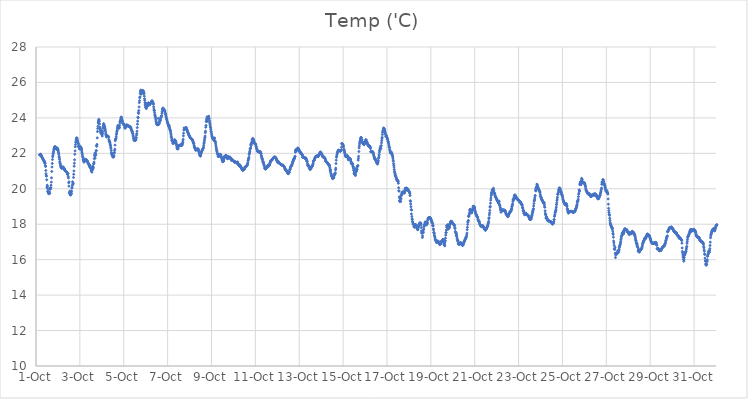
| Category | Temp ('C) |
|---|---|
| 44470.166666666664 | 21.901 |
| 44470.177083333336 | 21.917 |
| 44470.1875 | 21.921 |
| 44470.197916666664 | 21.93 |
| 44470.208333333336 | 21.951 |
| 44470.21875 | 21.933 |
| 44470.229166666664 | 21.903 |
| 44470.239583333336 | 21.851 |
| 44470.25 | 21.844 |
| 44470.260416666664 | 21.839 |
| 44470.270833333336 | 21.772 |
| 44470.28125 | 21.766 |
| 44470.291666666664 | 21.74 |
| 44470.302083333336 | 21.712 |
| 44470.3125 | 21.687 |
| 44470.322916666664 | 21.665 |
| 44470.333333333336 | 21.637 |
| 44470.34375 | 21.621 |
| 44470.354166666664 | 21.582 |
| 44470.364583333336 | 21.575 |
| 44470.375 | 21.547 |
| 44470.385416666664 | 21.524 |
| 44470.395833333336 | 21.463 |
| 44470.40625 | 21.459 |
| 44470.416666666664 | 21.432 |
| 44470.427083333336 | 21.306 |
| 44470.4375 | 21.258 |
| 44470.447916666664 | 21.032 |
| 44470.458333333336 | 20.848 |
| 44470.46875 | 20.729 |
| 44470.479166666664 | 20.719 |
| 44470.489583333336 | 20.507 |
| 44470.5 | 20.078 |
| 44470.510416666664 | 20.201 |
| 44470.520833333336 | 20.128 |
| 44470.53125 | 19.854 |
| 44470.541666666664 | 19.99 |
| 44470.552083333336 | 19.847 |
| 44470.5625 | 19.796 |
| 44470.572916666664 | 19.723 |
| 44470.583333333336 | 19.796 |
| 44470.59375 | 19.752 |
| 44470.604166666664 | 19.732 |
| 44470.614583333336 | 19.823 |
| 44470.625 | 19.741 |
| 44470.635416666664 | 20.01 |
| 44470.645833333336 | 19.971 |
| 44470.65625 | 20.056 |
| 44470.666666666664 | 20.004 |
| 44470.677083333336 | 20.052 |
| 44470.6875 | 20.198 |
| 44470.697916666664 | 20.375 |
| 44470.708333333336 | 20.617 |
| 44470.71875 | 20.979 |
| 44470.729166666664 | 21.23 |
| 44470.739583333336 | 21.43 |
| 44470.75 | 21.65 |
| 44470.760416666664 | 21.806 |
| 44470.770833333336 | 21.893 |
| 44470.78125 | 21.972 |
| 44470.791666666664 | 22.046 |
| 44470.802083333336 | 22.118 |
| 44470.8125 | 22.213 |
| 44470.822916666664 | 22.27 |
| 44470.833333333336 | 22.299 |
| 44470.84375 | 22.361 |
| 44470.854166666664 | 22.358 |
| 44470.864583333336 | 22.369 |
| 44470.875 | 22.365 |
| 44470.885416666664 | 22.349 |
| 44470.895833333336 | 22.336 |
| 44470.90625 | 22.324 |
| 44470.916666666664 | 22.285 |
| 44470.927083333336 | 22.234 |
| 44470.9375 | 22.228 |
| 44470.947916666664 | 22.246 |
| 44470.958333333336 | 22.294 |
| 44470.96875 | 22.253 |
| 44470.979166666664 | 22.286 |
| 44470.989583333336 | 22.243 |
| 44471.0 | 22.217 |
| 44471.010416666664 | 22.149 |
| 44471.020833333336 | 22.077 |
| 44471.03125 | 22.027 |
| 44471.041666666664 | 21.939 |
| 44471.052083333336 | 21.826 |
| 44471.0625 | 21.758 |
| 44471.072916666664 | 21.666 |
| 44471.083333333336 | 21.54 |
| 44471.09375 | 21.46 |
| 44471.104166666664 | 21.415 |
| 44471.114583333336 | 21.343 |
| 44471.125 | 21.276 |
| 44471.135416666664 | 21.243 |
| 44471.145833333336 | 21.2 |
| 44471.15625 | 21.172 |
| 44471.166666666664 | 21.156 |
| 44471.177083333336 | 21.251 |
| 44471.1875 | 21.169 |
| 44471.197916666664 | 21.225 |
| 44471.208333333336 | 21.168 |
| 44471.21875 | 21.193 |
| 44471.229166666664 | 21.202 |
| 44471.239583333336 | 21.214 |
| 44471.25 | 21.211 |
| 44471.260416666664 | 21.179 |
| 44471.270833333336 | 21.159 |
| 44471.28125 | 21.152 |
| 44471.291666666664 | 21.126 |
| 44471.302083333336 | 21.075 |
| 44471.3125 | 21.047 |
| 44471.322916666664 | 21.03 |
| 44471.333333333336 | 21.018 |
| 44471.34375 | 21.004 |
| 44471.354166666664 | 21.003 |
| 44471.364583333336 | 20.98 |
| 44471.375 | 20.969 |
| 44471.385416666664 | 20.954 |
| 44471.395833333336 | 20.945 |
| 44471.40625 | 20.946 |
| 44471.416666666664 | 20.909 |
| 44471.427083333336 | 20.82 |
| 44471.4375 | 20.84 |
| 44471.447916666664 | 20.859 |
| 44471.458333333336 | 20.855 |
| 44471.46875 | 20.705 |
| 44471.479166666664 | 20.613 |
| 44471.489583333336 | 20.338 |
| 44471.5 | 20.15 |
| 44471.510416666664 | 20.392 |
| 44471.520833333336 | 19.788 |
| 44471.53125 | 19.754 |
| 44471.541666666664 | 19.869 |
| 44471.552083333336 | 19.675 |
| 44471.5625 | 19.66 |
| 44471.572916666664 | 19.834 |
| 44471.583333333336 | 19.649 |
| 44471.59375 | 19.779 |
| 44471.604166666664 | 19.734 |
| 44471.614583333336 | 19.716 |
| 44471.625 | 19.86 |
| 44471.635416666664 | 20.031 |
| 44471.645833333336 | 20.079 |
| 44471.65625 | 20.194 |
| 44471.666666666664 | 20.394 |
| 44471.677083333336 | 20.261 |
| 44471.6875 | 20.275 |
| 44471.697916666664 | 20.314 |
| 44471.708333333336 | 20.639 |
| 44471.71875 | 20.817 |
| 44471.729166666664 | 21.006 |
| 44471.739583333336 | 21.274 |
| 44471.75 | 21.44 |
| 44471.760416666664 | 21.637 |
| 44471.770833333336 | 21.947 |
| 44471.78125 | 22.136 |
| 44471.791666666664 | 22.369 |
| 44471.802083333336 | 22.492 |
| 44471.8125 | 22.621 |
| 44471.822916666664 | 22.704 |
| 44471.833333333336 | 22.804 |
| 44471.84375 | 22.831 |
| 44471.854166666664 | 22.872 |
| 44471.864583333336 | 22.863 |
| 44471.875 | 22.849 |
| 44471.885416666664 | 22.746 |
| 44471.895833333336 | 22.707 |
| 44471.90625 | 22.627 |
| 44471.916666666664 | 22.578 |
| 44471.927083333336 | 22.549 |
| 44471.9375 | 22.384 |
| 44471.947916666664 | 22.427 |
| 44471.958333333336 | 22.362 |
| 44471.96875 | 22.34 |
| 44471.979166666664 | 22.243 |
| 44471.989583333336 | 22.429 |
| 44472.0 | 22.324 |
| 44472.010416666664 | 22.347 |
| 44472.020833333336 | 22.372 |
| 44472.03125 | 22.335 |
| 44472.041666666664 | 22.337 |
| 44472.052083333336 | 22.325 |
| 44472.0625 | 22.26 |
| 44472.072916666664 | 22.236 |
| 44472.083333333336 | 22.151 |
| 44472.09375 | 22.063 |
| 44472.104166666664 | 21.989 |
| 44472.114583333336 | 21.911 |
| 44472.125 | 21.822 |
| 44472.135416666664 | 21.782 |
| 44472.145833333336 | 21.672 |
| 44472.15625 | 21.618 |
| 44472.166666666664 | 21.591 |
| 44472.177083333336 | 21.562 |
| 44472.1875 | 21.501 |
| 44472.197916666664 | 21.529 |
| 44472.208333333336 | 21.625 |
| 44472.21875 | 21.68 |
| 44472.229166666664 | 21.627 |
| 44472.239583333336 | 21.618 |
| 44472.25 | 21.634 |
| 44472.260416666664 | 21.614 |
| 44472.270833333336 | 21.624 |
| 44472.28125 | 21.654 |
| 44472.291666666664 | 21.637 |
| 44472.302083333336 | 21.608 |
| 44472.3125 | 21.599 |
| 44472.322916666664 | 21.587 |
| 44472.333333333336 | 21.572 |
| 44472.34375 | 21.544 |
| 44472.354166666664 | 21.513 |
| 44472.364583333336 | 21.478 |
| 44472.375 | 21.447 |
| 44472.385416666664 | 21.429 |
| 44472.395833333336 | 21.402 |
| 44472.40625 | 21.379 |
| 44472.416666666664 | 21.352 |
| 44472.427083333336 | 21.329 |
| 44472.4375 | 21.278 |
| 44472.447916666664 | 21.251 |
| 44472.458333333336 | 21.331 |
| 44472.46875 | 21.201 |
| 44472.479166666664 | 21.211 |
| 44472.489583333336 | 21.215 |
| 44472.5 | 21.17 |
| 44472.510416666664 | 21.065 |
| 44472.520833333336 | 20.999 |
| 44472.53125 | 21.019 |
| 44472.541666666664 | 21.058 |
| 44472.552083333336 | 20.94 |
| 44472.5625 | 21.066 |
| 44472.572916666664 | 21.188 |
| 44472.583333333336 | 21.09 |
| 44472.59375 | 21.275 |
| 44472.604166666664 | 21.155 |
| 44472.614583333336 | 21.213 |
| 44472.625 | 21.409 |
| 44472.635416666664 | 21.422 |
| 44472.645833333336 | 21.508 |
| 44472.65625 | 21.701 |
| 44472.666666666664 | 21.896 |
| 44472.677083333336 | 21.854 |
| 44472.6875 | 22.013 |
| 44472.697916666664 | 21.731 |
| 44472.708333333336 | 21.928 |
| 44472.71875 | 22.006 |
| 44472.729166666664 | 21.898 |
| 44472.739583333336 | 22.145 |
| 44472.75 | 22.152 |
| 44472.760416666664 | 22.43 |
| 44472.770833333336 | 22.398 |
| 44472.78125 | 22.503 |
| 44472.791666666664 | 22.873 |
| 44472.802083333336 | 23.231 |
| 44472.8125 | 23.405 |
| 44472.822916666664 | 23.527 |
| 44472.833333333336 | 23.708 |
| 44472.84375 | 23.789 |
| 44472.854166666664 | 23.86 |
| 44472.864583333336 | 23.915 |
| 44472.875 | 23.87 |
| 44472.885416666664 | 23.791 |
| 44472.895833333336 | 23.653 |
| 44472.90625 | 23.394 |
| 44472.916666666664 | 23.468 |
| 44472.927083333336 | 23.371 |
| 44472.9375 | 23.272 |
| 44472.947916666664 | 23.195 |
| 44472.958333333336 | 23.206 |
| 44472.96875 | 23.118 |
| 44472.979166666664 | 23.106 |
| 44472.989583333336 | 23.089 |
| 44473.0 | 23.285 |
| 44473.010416666664 | 23.064 |
| 44473.020833333336 | 22.98 |
| 44473.03125 | 23.128 |
| 44473.041666666664 | 23.229 |
| 44473.052083333336 | 23.49 |
| 44473.0625 | 23.411 |
| 44473.072916666664 | 23.599 |
| 44473.083333333336 | 23.681 |
| 44473.09375 | 23.63 |
| 44473.104166666664 | 23.55 |
| 44473.114583333336 | 23.565 |
| 44473.125 | 23.492 |
| 44473.135416666664 | 23.474 |
| 44473.145833333336 | 23.388 |
| 44473.15625 | 23.323 |
| 44473.166666666664 | 23.243 |
| 44473.177083333336 | 23.136 |
| 44473.1875 | 23.061 |
| 44473.197916666664 | 23.01 |
| 44473.208333333336 | 22.969 |
| 44473.21875 | 22.926 |
| 44473.229166666664 | 22.925 |
| 44473.239583333336 | 22.976 |
| 44473.25 | 23 |
| 44473.260416666664 | 22.952 |
| 44473.270833333336 | 22.971 |
| 44473.28125 | 22.968 |
| 44473.291666666664 | 22.938 |
| 44473.302083333336 | 22.948 |
| 44473.3125 | 22.906 |
| 44473.322916666664 | 22.778 |
| 44473.333333333336 | 22.697 |
| 44473.34375 | 22.68 |
| 44473.354166666664 | 22.666 |
| 44473.364583333336 | 22.626 |
| 44473.375 | 22.575 |
| 44473.385416666664 | 22.492 |
| 44473.395833333336 | 22.437 |
| 44473.40625 | 22.349 |
| 44473.416666666664 | 22.285 |
| 44473.427083333336 | 22.172 |
| 44473.4375 | 22.052 |
| 44473.447916666664 | 21.987 |
| 44473.458333333336 | 21.931 |
| 44473.46875 | 21.918 |
| 44473.479166666664 | 21.869 |
| 44473.489583333336 | 21.871 |
| 44473.5 | 21.796 |
| 44473.510416666664 | 21.81 |
| 44473.520833333336 | 21.792 |
| 44473.53125 | 21.798 |
| 44473.541666666664 | 21.817 |
| 44473.552083333336 | 21.866 |
| 44473.5625 | 22.011 |
| 44473.572916666664 | 22.035 |
| 44473.583333333336 | 22.153 |
| 44473.59375 | 22.233 |
| 44473.604166666664 | 22.466 |
| 44473.614583333336 | 22.716 |
| 44473.625 | 22.778 |
| 44473.635416666664 | 22.822 |
| 44473.645833333336 | 22.836 |
| 44473.65625 | 22.933 |
| 44473.666666666664 | 23.057 |
| 44473.677083333336 | 23.143 |
| 44473.6875 | 23.229 |
| 44473.697916666664 | 23.283 |
| 44473.708333333336 | 23.382 |
| 44473.71875 | 23.476 |
| 44473.729166666664 | 23.539 |
| 44473.739583333336 | 23.572 |
| 44473.75 | 23.442 |
| 44473.760416666664 | 23.436 |
| 44473.770833333336 | 23.449 |
| 44473.78125 | 23.42 |
| 44473.791666666664 | 23.439 |
| 44473.802083333336 | 23.466 |
| 44473.8125 | 23.573 |
| 44473.822916666664 | 23.716 |
| 44473.833333333336 | 23.808 |
| 44473.84375 | 23.813 |
| 44473.854166666664 | 23.874 |
| 44473.864583333336 | 23.934 |
| 44473.875 | 24.029 |
| 44473.885416666664 | 24.051 |
| 44473.895833333336 | 24.022 |
| 44473.90625 | 23.947 |
| 44473.916666666664 | 23.893 |
| 44473.927083333336 | 23.854 |
| 44473.9375 | 23.819 |
| 44473.947916666664 | 23.747 |
| 44473.958333333336 | 23.698 |
| 44473.96875 | 23.659 |
| 44473.979166666664 | 23.669 |
| 44473.989583333336 | 23.657 |
| 44474.0 | 23.638 |
| 44474.010416666664 | 23.585 |
| 44474.020833333336 | 23.645 |
| 44474.03125 | 23.601 |
| 44474.041666666664 | 23.444 |
| 44474.052083333336 | 23.471 |
| 44474.0625 | 23.412 |
| 44474.072916666664 | 23.461 |
| 44474.083333333336 | 23.495 |
| 44474.09375 | 23.527 |
| 44474.104166666664 | 23.572 |
| 44474.114583333336 | 23.569 |
| 44474.125 | 23.566 |
| 44474.135416666664 | 23.596 |
| 44474.145833333336 | 23.603 |
| 44474.15625 | 23.587 |
| 44474.166666666664 | 23.576 |
| 44474.177083333336 | 23.562 |
| 44474.1875 | 23.549 |
| 44474.197916666664 | 23.538 |
| 44474.208333333336 | 23.527 |
| 44474.21875 | 23.538 |
| 44474.229166666664 | 23.53 |
| 44474.239583333336 | 23.51 |
| 44474.25 | 23.536 |
| 44474.260416666664 | 23.521 |
| 44474.270833333336 | 23.487 |
| 44474.28125 | 23.487 |
| 44474.291666666664 | 23.493 |
| 44474.302083333336 | 23.481 |
| 44474.3125 | 23.46 |
| 44474.322916666664 | 23.447 |
| 44474.333333333336 | 23.395 |
| 44474.34375 | 23.329 |
| 44474.354166666664 | 23.3 |
| 44474.364583333336 | 23.283 |
| 44474.375 | 23.264 |
| 44474.385416666664 | 23.227 |
| 44474.395833333336 | 23.178 |
| 44474.40625 | 23.136 |
| 44474.416666666664 | 23.099 |
| 44474.427083333336 | 23.017 |
| 44474.4375 | 22.945 |
| 44474.447916666664 | 22.856 |
| 44474.458333333336 | 22.814 |
| 44474.46875 | 22.742 |
| 44474.479166666664 | 22.735 |
| 44474.489583333336 | 22.734 |
| 44474.5 | 22.723 |
| 44474.510416666664 | 22.716 |
| 44474.520833333336 | 22.729 |
| 44474.53125 | 22.749 |
| 44474.541666666664 | 22.737 |
| 44474.552083333336 | 22.89 |
| 44474.5625 | 22.802 |
| 44474.572916666664 | 22.884 |
| 44474.583333333336 | 23.03 |
| 44474.59375 | 23.109 |
| 44474.604166666664 | 23.246 |
| 44474.614583333336 | 23.45 |
| 44474.625 | 23.646 |
| 44474.635416666664 | 23.815 |
| 44474.645833333336 | 24.042 |
| 44474.65625 | 24.002 |
| 44474.666666666664 | 24.309 |
| 44474.677083333336 | 24.252 |
| 44474.6875 | 24.413 |
| 44474.697916666664 | 24.619 |
| 44474.708333333336 | 24.863 |
| 44474.71875 | 24.973 |
| 44474.729166666664 | 25.135 |
| 44474.739583333336 | 25.186 |
| 44474.75 | 25.374 |
| 44474.760416666664 | 25.483 |
| 44474.770833333336 | 25.546 |
| 44474.78125 | 25.572 |
| 44474.791666666664 | 25.334 |
| 44474.802083333336 | 25.411 |
| 44474.8125 | 25.431 |
| 44474.822916666664 | 25.493 |
| 44474.833333333336 | 25.442 |
| 44474.84375 | 25.396 |
| 44474.854166666664 | 25.477 |
| 44474.864583333336 | 25.546 |
| 44474.875 | 25.528 |
| 44474.885416666664 | 25.512 |
| 44474.895833333336 | 25.493 |
| 44474.90625 | 25.464 |
| 44474.916666666664 | 25.42 |
| 44474.927083333336 | 25.359 |
| 44474.9375 | 25.225 |
| 44474.947916666664 | 25.082 |
| 44474.958333333336 | 24.99 |
| 44474.96875 | 24.864 |
| 44474.979166666664 | 24.763 |
| 44474.989583333336 | 24.688 |
| 44475.0 | 24.606 |
| 44475.010416666664 | 24.579 |
| 44475.020833333336 | 24.58 |
| 44475.03125 | 24.528 |
| 44475.041666666664 | 24.729 |
| 44475.052083333336 | 24.817 |
| 44475.0625 | 24.797 |
| 44475.072916666664 | 24.688 |
| 44475.083333333336 | 24.661 |
| 44475.09375 | 24.706 |
| 44475.104166666664 | 24.728 |
| 44475.114583333336 | 24.782 |
| 44475.125 | 24.843 |
| 44475.135416666664 | 24.843 |
| 44475.145833333336 | 24.813 |
| 44475.15625 | 24.788 |
| 44475.166666666664 | 24.743 |
| 44475.177083333336 | 24.747 |
| 44475.1875 | 24.751 |
| 44475.197916666664 | 24.772 |
| 44475.208333333336 | 24.817 |
| 44475.21875 | 24.829 |
| 44475.229166666664 | 24.827 |
| 44475.239583333336 | 24.866 |
| 44475.25 | 24.862 |
| 44475.260416666664 | 24.88 |
| 44475.270833333336 | 24.948 |
| 44475.28125 | 24.94 |
| 44475.291666666664 | 24.952 |
| 44475.302083333336 | 24.953 |
| 44475.3125 | 24.884 |
| 44475.322916666664 | 24.834 |
| 44475.333333333336 | 24.872 |
| 44475.34375 | 24.821 |
| 44475.354166666664 | 24.764 |
| 44475.364583333336 | 24.621 |
| 44475.375 | 24.497 |
| 44475.385416666664 | 24.433 |
| 44475.395833333336 | 24.407 |
| 44475.40625 | 24.304 |
| 44475.416666666664 | 24.192 |
| 44475.427083333336 | 24.135 |
| 44475.4375 | 24.079 |
| 44475.447916666664 | 24.013 |
| 44475.458333333336 | 23.93 |
| 44475.46875 | 23.832 |
| 44475.479166666664 | 23.779 |
| 44475.489583333336 | 23.717 |
| 44475.5 | 23.67 |
| 44475.510416666664 | 23.64 |
| 44475.520833333336 | 23.623 |
| 44475.53125 | 23.62 |
| 44475.541666666664 | 23.621 |
| 44475.552083333336 | 23.61 |
| 44475.5625 | 23.64 |
| 44475.572916666664 | 23.97 |
| 44475.583333333336 | 23.633 |
| 44475.59375 | 23.632 |
| 44475.604166666664 | 23.678 |
| 44475.614583333336 | 23.689 |
| 44475.625 | 23.744 |
| 44475.635416666664 | 23.795 |
| 44475.645833333336 | 23.813 |
| 44475.65625 | 23.849 |
| 44475.666666666664 | 23.861 |
| 44475.677083333336 | 23.945 |
| 44475.6875 | 23.996 |
| 44475.697916666664 | 24.041 |
| 44475.708333333336 | 24.09 |
| 44475.71875 | 24.103 |
| 44475.729166666664 | 24.112 |
| 44475.739583333336 | 24.254 |
| 44475.75 | 24.347 |
| 44475.760416666664 | 24.441 |
| 44475.770833333336 | 24.505 |
| 44475.78125 | 24.544 |
| 44475.791666666664 | 24.553 |
| 44475.802083333336 | 24.532 |
| 44475.8125 | 24.512 |
| 44475.822916666664 | 24.486 |
| 44475.833333333336 | 24.451 |
| 44475.84375 | 24.434 |
| 44475.854166666664 | 24.429 |
| 44475.864583333336 | 24.414 |
| 44475.875 | 24.386 |
| 44475.885416666664 | 24.325 |
| 44475.895833333336 | 24.258 |
| 44475.90625 | 24.207 |
| 44475.916666666664 | 24.171 |
| 44475.927083333336 | 24.099 |
| 44475.9375 | 24.035 |
| 44475.947916666664 | 23.972 |
| 44475.958333333336 | 23.919 |
| 44475.96875 | 23.88 |
| 44475.979166666664 | 23.82 |
| 44475.989583333336 | 23.768 |
| 44476.0 | 23.728 |
| 44476.010416666664 | 23.682 |
| 44476.020833333336 | 23.625 |
| 44476.03125 | 23.595 |
| 44476.041666666664 | 23.568 |
| 44476.052083333336 | 23.522 |
| 44476.0625 | 23.5 |
| 44476.072916666664 | 23.576 |
| 44476.083333333336 | 23.436 |
| 44476.09375 | 23.429 |
| 44476.104166666664 | 23.347 |
| 44476.114583333336 | 23.323 |
| 44476.125 | 23.291 |
| 44476.135416666664 | 23.21 |
| 44476.145833333336 | 23.139 |
| 44476.15625 | 23.046 |
| 44476.166666666664 | 22.958 |
| 44476.177083333336 | 22.887 |
| 44476.1875 | 22.734 |
| 44476.197916666664 | 22.815 |
| 44476.208333333336 | 22.733 |
| 44476.21875 | 22.681 |
| 44476.229166666664 | 22.655 |
| 44476.239583333336 | 22.573 |
| 44476.25 | 22.586 |
| 44476.260416666664 | 22.548 |
| 44476.270833333336 | 22.598 |
| 44476.28125 | 22.676 |
| 44476.291666666664 | 22.607 |
| 44476.302083333336 | 22.675 |
| 44476.3125 | 22.654 |
| 44476.322916666664 | 22.774 |
| 44476.333333333336 | 22.677 |
| 44476.34375 | 22.658 |
| 44476.354166666664 | 22.716 |
| 44476.364583333336 | 22.698 |
| 44476.375 | 22.648 |
| 44476.385416666664 | 22.596 |
| 44476.395833333336 | 22.537 |
| 44476.40625 | 22.478 |
| 44476.416666666664 | 22.415 |
| 44476.427083333336 | 22.324 |
| 44476.4375 | 22.269 |
| 44476.447916666664 | 22.271 |
| 44476.458333333336 | 22.251 |
| 44476.46875 | 22.244 |
| 44476.479166666664 | 22.287 |
| 44476.489583333336 | 22.364 |
| 44476.5 | 22.414 |
| 44476.510416666664 | 22.425 |
| 44476.520833333336 | 22.446 |
| 44476.53125 | 22.453 |
| 44476.541666666664 | 22.448 |
| 44476.552083333336 | 22.443 |
| 44476.5625 | 22.447 |
| 44476.572916666664 | 22.45 |
| 44476.583333333336 | 22.461 |
| 44476.59375 | 22.478 |
| 44476.604166666664 | 22.483 |
| 44476.614583333336 | 22.477 |
| 44476.625 | 22.452 |
| 44476.635416666664 | 22.444 |
| 44476.645833333336 | 22.46 |
| 44476.65625 | 22.461 |
| 44476.666666666664 | 22.503 |
| 44476.677083333336 | 22.555 |
| 44476.6875 | 22.613 |
| 44476.697916666664 | 22.693 |
| 44476.708333333336 | 22.789 |
| 44476.71875 | 22.986 |
| 44476.729166666664 | 23.132 |
| 44476.739583333336 | 23.31 |
| 44476.75 | 23.435 |
| 44476.760416666664 | 23.368 |
| 44476.770833333336 | 23.397 |
| 44476.78125 | 23.392 |
| 44476.791666666664 | 23.362 |
| 44476.802083333336 | 23.435 |
| 44476.8125 | 23.403 |
| 44476.822916666664 | 23.401 |
| 44476.833333333336 | 23.428 |
| 44476.84375 | 23.462 |
| 44476.854166666664 | 23.423 |
| 44476.864583333336 | 23.387 |
| 44476.875 | 23.345 |
| 44476.885416666664 | 23.322 |
| 44476.895833333336 | 23.28 |
| 44476.90625 | 23.231 |
| 44476.916666666664 | 23.203 |
| 44476.927083333336 | 23.161 |
| 44476.9375 | 23.151 |
| 44476.947916666664 | 23.113 |
| 44476.958333333336 | 23.072 |
| 44476.96875 | 23.04 |
| 44476.979166666664 | 23.014 |
| 44476.989583333336 | 22.989 |
| 44477.0 | 22.965 |
| 44477.010416666664 | 22.94 |
| 44477.020833333336 | 22.907 |
| 44477.03125 | 22.882 |
| 44477.041666666664 | 22.868 |
| 44477.052083333336 | 22.854 |
| 44477.0625 | 22.84 |
| 44477.072916666664 | 22.829 |
| 44477.083333333336 | 22.817 |
| 44477.09375 | 22.806 |
| 44477.104166666664 | 22.79 |
| 44477.114583333336 | 22.788 |
| 44477.125 | 22.762 |
| 44477.135416666664 | 22.756 |
| 44477.145833333336 | 22.693 |
| 44477.15625 | 22.689 |
| 44477.166666666664 | 22.627 |
| 44477.177083333336 | 22.602 |
| 44477.1875 | 22.548 |
| 44477.197916666664 | 22.535 |
| 44477.208333333336 | 22.425 |
| 44477.21875 | 22.397 |
| 44477.229166666664 | 22.319 |
| 44477.239583333336 | 22.328 |
| 44477.25 | 22.285 |
| 44477.260416666664 | 22.265 |
| 44477.270833333336 | 22.205 |
| 44477.28125 | 22.198 |
| 44477.291666666664 | 22.173 |
| 44477.302083333336 | 22.202 |
| 44477.3125 | 22.207 |
| 44477.322916666664 | 22.233 |
| 44477.333333333336 | 22.236 |
| 44477.34375 | 22.231 |
| 44477.354166666664 | 22.246 |
| 44477.364583333336 | 22.197 |
| 44477.375 | 22.23 |
| 44477.385416666664 | 22.257 |
| 44477.395833333336 | 22.23 |
| 44477.40625 | 22.201 |
| 44477.416666666664 | 22.148 |
| 44477.427083333336 | 22.106 |
| 44477.4375 | 22.054 |
| 44477.447916666664 | 22.005 |
| 44477.458333333336 | 21.934 |
| 44477.46875 | 21.894 |
| 44477.479166666664 | 21.871 |
| 44477.489583333336 | 21.846 |
| 44477.5 | 21.853 |
| 44477.510416666664 | 21.914 |
| 44477.520833333336 | 21.972 |
| 44477.53125 | 22.033 |
| 44477.541666666664 | 22.073 |
| 44477.552083333336 | 22.1 |
| 44477.5625 | 22.136 |
| 44477.572916666664 | 22.169 |
| 44477.583333333336 | 22.191 |
| 44477.59375 | 22.224 |
| 44477.604166666664 | 22.249 |
| 44477.614583333336 | 22.275 |
| 44477.625 | 22.295 |
| 44477.635416666664 | 22.346 |
| 44477.645833333336 | 22.449 |
| 44477.65625 | 22.558 |
| 44477.666666666664 | 22.628 |
| 44477.677083333336 | 22.718 |
| 44477.6875 | 22.812 |
| 44477.697916666664 | 22.898 |
| 44477.708333333336 | 22.975 |
| 44477.71875 | 23.165 |
| 44477.729166666664 | 23.249 |
| 44477.739583333336 | 23.474 |
| 44477.75 | 23.573 |
| 44477.760416666664 | 23.791 |
| 44477.770833333336 | 23.876 |
| 44477.78125 | 23.95 |
| 44477.791666666664 | 24.052 |
| 44477.802083333336 | 23.805 |
| 44477.8125 | 23.907 |
| 44477.822916666664 | 23.947 |
| 44477.833333333336 | 24.03 |
| 44477.84375 | 24.049 |
| 44477.854166666664 | 24.066 |
| 44477.864583333336 | 24.001 |
| 44477.875 | 24.093 |
| 44477.885416666664 | 23.984 |
| 44477.895833333336 | 23.94 |
| 44477.90625 | 23.838 |
| 44477.916666666664 | 23.749 |
| 44477.927083333336 | 23.666 |
| 44477.9375 | 23.601 |
| 44477.947916666664 | 23.497 |
| 44477.958333333336 | 23.446 |
| 44477.96875 | 23.352 |
| 44477.979166666664 | 23.242 |
| 44477.989583333336 | 23.226 |
| 44478.0 | 23.129 |
| 44478.010416666664 | 23.035 |
| 44478.020833333336 | 22.978 |
| 44478.03125 | 22.934 |
| 44478.041666666664 | 22.887 |
| 44478.052083333336 | 22.863 |
| 44478.0625 | 22.838 |
| 44478.072916666664 | 22.815 |
| 44478.083333333336 | 22.795 |
| 44478.09375 | 22.785 |
| 44478.104166666664 | 22.767 |
| 44478.114583333336 | 22.754 |
| 44478.125 | 22.719 |
| 44478.135416666664 | 22.713 |
| 44478.145833333336 | 22.868 |
| 44478.15625 | 22.691 |
| 44478.166666666664 | 22.687 |
| 44478.177083333336 | 22.647 |
| 44478.1875 | 22.577 |
| 44478.197916666664 | 22.475 |
| 44478.208333333336 | 22.379 |
| 44478.21875 | 22.294 |
| 44478.229166666664 | 22.226 |
| 44478.239583333336 | 22.151 |
| 44478.25 | 22.095 |
| 44478.260416666664 | 22.001 |
| 44478.270833333336 | 22.003 |
| 44478.28125 | 21.969 |
| 44478.291666666664 | 21.909 |
| 44478.302083333336 | 21.828 |
| 44478.3125 | 21.855 |
| 44478.322916666664 | 21.822 |
| 44478.333333333336 | 21.842 |
| 44478.34375 | 21.842 |
| 44478.354166666664 | 21.832 |
| 44478.364583333336 | 21.876 |
| 44478.375 | 21.942 |
| 44478.385416666664 | 21.925 |
| 44478.395833333336 | 21.905 |
| 44478.40625 | 21.91 |
| 44478.416666666664 | 21.936 |
| 44478.427083333336 | 21.906 |
| 44478.4375 | 21.844 |
| 44478.447916666664 | 21.815 |
| 44478.458333333336 | 21.762 |
| 44478.46875 | 21.721 |
| 44478.479166666664 | 21.667 |
| 44478.489583333336 | 21.59 |
| 44478.5 | 21.55 |
| 44478.510416666664 | 21.524 |
| 44478.520833333336 | 21.548 |
| 44478.53125 | 21.56 |
| 44478.541666666664 | 21.547 |
| 44478.552083333336 | 21.556 |
| 44478.5625 | 21.637 |
| 44478.572916666664 | 21.72 |
| 44478.583333333336 | 21.764 |
| 44478.59375 | 21.828 |
| 44478.604166666664 | 21.822 |
| 44478.614583333336 | 21.837 |
| 44478.625 | 21.847 |
| 44478.635416666664 | 21.844 |
| 44478.645833333336 | 21.865 |
| 44478.65625 | 21.877 |
| 44478.666666666664 | 21.886 |
| 44478.677083333336 | 21.872 |
| 44478.6875 | 21.822 |
| 44478.697916666664 | 21.82 |
| 44478.708333333336 | 21.757 |
| 44478.71875 | 21.72 |
| 44478.729166666664 | 21.703 |
| 44478.739583333336 | 21.696 |
| 44478.75 | 21.805 |
| 44478.760416666664 | 21.744 |
| 44478.770833333336 | 21.791 |
| 44478.78125 | 21.78 |
| 44478.791666666664 | 21.805 |
| 44478.802083333336 | 21.784 |
| 44478.8125 | 21.782 |
| 44478.822916666664 | 21.747 |
| 44478.833333333336 | 21.755 |
| 44478.84375 | 21.772 |
| 44478.854166666664 | 21.777 |
| 44478.864583333336 | 21.743 |
| 44478.875 | 21.716 |
| 44478.885416666664 | 21.671 |
| 44478.895833333336 | 21.66 |
| 44478.90625 | 21.643 |
| 44478.916666666664 | 21.596 |
| 44478.927083333336 | 21.601 |
| 44478.9375 | 21.661 |
| 44478.947916666664 | 21.621 |
| 44478.958333333336 | 21.63 |
| 44478.96875 | 21.624 |
| 44478.979166666664 | 21.604 |
| 44478.989583333336 | 21.584 |
| 44479.0 | 21.566 |
| 44479.010416666664 | 21.559 |
| 44479.020833333336 | 21.563 |
| 44479.03125 | 21.55 |
| 44479.041666666664 | 21.511 |
| 44479.052083333336 | 21.505 |
| 44479.0625 | 21.502 |
| 44479.072916666664 | 21.511 |
| 44479.083333333336 | 21.513 |
| 44479.09375 | 21.52 |
| 44479.104166666664 | 21.511 |
| 44479.114583333336 | 21.481 |
| 44479.125 | 21.47 |
| 44479.135416666664 | 21.465 |
| 44479.145833333336 | 21.469 |
| 44479.15625 | 21.476 |
| 44479.166666666664 | 21.494 |
| 44479.177083333336 | 21.49 |
| 44479.1875 | 21.48 |
| 44479.197916666664 | 21.514 |
| 44479.208333333336 | 21.402 |
| 44479.21875 | 21.409 |
| 44479.229166666664 | 21.367 |
| 44479.239583333336 | 21.344 |
| 44479.25 | 21.318 |
| 44479.260416666664 | 21.315 |
| 44479.270833333336 | 21.327 |
| 44479.28125 | 21.367 |
| 44479.291666666664 | 21.298 |
| 44479.302083333336 | 21.246 |
| 44479.3125 | 21.246 |
| 44479.322916666664 | 21.295 |
| 44479.333333333336 | 21.246 |
| 44479.34375 | 21.23 |
| 44479.354166666664 | 21.189 |
| 44479.364583333336 | 21.144 |
| 44479.375 | 21.159 |
| 44479.385416666664 | 21.132 |
| 44479.395833333336 | 21.069 |
| 44479.40625 | 21.098 |
| 44479.416666666664 | 21.079 |
| 44479.427083333336 | 21.038 |
| 44479.4375 | 21.044 |
| 44479.447916666664 | 21.102 |
| 44479.458333333336 | 21.081 |
| 44479.46875 | 21.078 |
| 44479.479166666664 | 21.08 |
| 44479.489583333336 | 21.097 |
| 44479.5 | 21.116 |
| 44479.510416666664 | 21.145 |
| 44479.520833333336 | 21.2 |
| 44479.53125 | 21.233 |
| 44479.541666666664 | 21.221 |
| 44479.552083333336 | 21.224 |
| 44479.5625 | 21.241 |
| 44479.572916666664 | 21.249 |
| 44479.583333333336 | 21.272 |
| 44479.59375 | 21.289 |
| 44479.604166666664 | 21.287 |
| 44479.614583333336 | 21.301 |
| 44479.625 | 21.326 |
| 44479.635416666664 | 21.362 |
| 44479.645833333336 | 21.403 |
| 44479.65625 | 21.462 |
| 44479.666666666664 | 21.581 |
| 44479.677083333336 | 21.625 |
| 44479.6875 | 21.687 |
| 44479.697916666664 | 21.723 |
| 44479.708333333336 | 21.785 |
| 44479.71875 | 21.931 |
| 44479.729166666664 | 21.999 |
| 44479.739583333336 | 22.074 |
| 44479.75 | 22.129 |
| 44479.760416666664 | 22.237 |
| 44479.770833333336 | 22.272 |
| 44479.78125 | 22.317 |
| 44479.791666666664 | 22.516 |
| 44479.802083333336 | 22.44 |
| 44479.8125 | 22.471 |
| 44479.822916666664 | 22.55 |
| 44479.833333333336 | 22.583 |
| 44479.84375 | 22.654 |
| 44479.854166666664 | 22.75 |
| 44479.864583333336 | 22.78 |
| 44479.875 | 22.81 |
| 44479.885416666664 | 22.838 |
| 44479.895833333336 | 22.796 |
| 44479.90625 | 22.796 |
| 44479.916666666664 | 22.752 |
| 44479.927083333336 | 22.714 |
| 44479.9375 | 22.661 |
| 44479.947916666664 | 22.607 |
| 44479.958333333336 | 22.561 |
| 44479.96875 | 22.551 |
| 44479.979166666664 | 22.583 |
| 44479.989583333336 | 22.554 |
| 44480.0 | 22.527 |
| 44480.010416666664 | 22.509 |
| 44480.020833333336 | 22.476 |
| 44480.03125 | 22.413 |
| 44480.041666666664 | 22.368 |
| 44480.052083333336 | 22.287 |
| 44480.0625 | 22.268 |
| 44480.072916666664 | 22.208 |
| 44480.083333333336 | 22.126 |
| 44480.09375 | 22.158 |
| 44480.104166666664 | 22.145 |
| 44480.114583333336 | 22.109 |
| 44480.125 | 22.087 |
| 44480.135416666664 | 22.076 |
| 44480.145833333336 | 22.1 |
| 44480.15625 | 22.097 |
| 44480.166666666664 | 22.096 |
| 44480.177083333336 | 22.087 |
| 44480.1875 | 22.09 |
| 44480.197916666664 | 22.091 |
| 44480.208333333336 | 22.087 |
| 44480.21875 | 22.076 |
| 44480.229166666664 | 22.073 |
| 44480.239583333336 | 22.052 |
| 44480.25 | 21.977 |
| 44480.260416666664 | 21.989 |
| 44480.270833333336 | 21.886 |
| 44480.28125 | 21.828 |
| 44480.291666666664 | 21.756 |
| 44480.302083333336 | 21.714 |
| 44480.3125 | 21.676 |
| 44480.322916666664 | 21.667 |
| 44480.333333333336 | 21.591 |
| 44480.34375 | 21.511 |
| 44480.354166666664 | 21.494 |
| 44480.364583333336 | 21.494 |
| 44480.375 | 21.473 |
| 44480.385416666664 | 21.376 |
| 44480.395833333336 | 21.346 |
| 44480.40625 | 21.292 |
| 44480.416666666664 | 21.253 |
| 44480.427083333336 | 21.146 |
| 44480.4375 | 21.18 |
| 44480.447916666664 | 21.168 |
| 44480.458333333336 | 21.108 |
| 44480.46875 | 21.117 |
| 44480.479166666664 | 21.138 |
| 44480.489583333336 | 21.163 |
| 44480.5 | 21.163 |
| 44480.510416666664 | 21.176 |
| 44480.520833333336 | 21.21 |
| 44480.53125 | 21.218 |
| 44480.541666666664 | 21.221 |
| 44480.552083333336 | 21.223 |
| 44480.5625 | 21.29 |
| 44480.572916666664 | 21.326 |
| 44480.583333333336 | 21.307 |
| 44480.59375 | 21.294 |
| 44480.604166666664 | 21.288 |
| 44480.614583333336 | 21.293 |
| 44480.625 | 21.299 |
| 44480.635416666664 | 21.332 |
| 44480.645833333336 | 21.362 |
| 44480.65625 | 21.417 |
| 44480.666666666664 | 21.451 |
| 44480.677083333336 | 21.493 |
| 44480.6875 | 21.529 |
| 44480.697916666664 | 21.562 |
| 44480.708333333336 | 21.575 |
| 44480.71875 | 21.591 |
| 44480.729166666664 | 21.599 |
| 44480.739583333336 | 21.608 |
| 44480.75 | 21.622 |
| 44480.760416666664 | 21.634 |
| 44480.770833333336 | 21.655 |
| 44480.78125 | 21.672 |
| 44480.791666666664 | 21.682 |
| 44480.802083333336 | 21.695 |
| 44480.8125 | 21.727 |
| 44480.822916666664 | 21.732 |
| 44480.833333333336 | 21.744 |
| 44480.84375 | 21.77 |
| 44480.854166666664 | 21.784 |
| 44480.864583333336 | 21.795 |
| 44480.875 | 21.773 |
| 44480.885416666664 | 21.783 |
| 44480.895833333336 | 21.783 |
| 44480.90625 | 21.781 |
| 44480.916666666664 | 21.769 |
| 44480.927083333336 | 21.749 |
| 44480.9375 | 21.728 |
| 44480.947916666664 | 21.711 |
| 44480.958333333336 | 21.679 |
| 44480.96875 | 21.637 |
| 44480.979166666664 | 21.604 |
| 44480.989583333336 | 21.574 |
| 44481.0 | 21.53 |
| 44481.010416666664 | 21.513 |
| 44481.020833333336 | 21.483 |
| 44481.03125 | 21.567 |
| 44481.041666666664 | 21.529 |
| 44481.052083333336 | 21.5 |
| 44481.0625 | 21.492 |
| 44481.072916666664 | 21.467 |
| 44481.083333333336 | 21.458 |
| 44481.09375 | 21.448 |
| 44481.104166666664 | 21.441 |
| 44481.114583333336 | 21.424 |
| 44481.125 | 21.411 |
| 44481.135416666664 | 21.4 |
| 44481.145833333336 | 21.389 |
| 44481.15625 | 21.383 |
| 44481.166666666664 | 21.374 |
| 44481.177083333336 | 21.362 |
| 44481.1875 | 21.355 |
| 44481.197916666664 | 21.348 |
| 44481.208333333336 | 21.342 |
| 44481.21875 | 21.335 |
| 44481.229166666664 | 21.327 |
| 44481.239583333336 | 21.324 |
| 44481.25 | 21.319 |
| 44481.260416666664 | 21.337 |
| 44481.270833333336 | 21.312 |
| 44481.28125 | 21.305 |
| 44481.291666666664 | 21.268 |
| 44481.302083333336 | 21.251 |
| 44481.3125 | 21.247 |
| 44481.322916666664 | 21.246 |
| 44481.333333333336 | 21.203 |
| 44481.34375 | 21.12 |
| 44481.354166666664 | 21.127 |
| 44481.364583333336 | 21.108 |
| 44481.375 | 21.064 |
| 44481.385416666664 | 21.081 |
| 44481.395833333336 | 21.029 |
| 44481.40625 | 21.052 |
| 44481.416666666664 | 21.018 |
| 44481.427083333336 | 20.992 |
| 44481.4375 | 21.002 |
| 44481.447916666664 | 20.956 |
| 44481.458333333336 | 20.939 |
| 44481.46875 | 20.906 |
| 44481.479166666664 | 20.869 |
| 44481.489583333336 | 20.863 |
| 44481.5 | 20.854 |
| 44481.510416666664 | 20.856 |
| 44481.520833333336 | 20.911 |
| 44481.53125 | 20.904 |
| 44481.541666666664 | 20.919 |
| 44481.552083333336 | 20.935 |
| 44481.5625 | 21.046 |
| 44481.572916666664 | 21.069 |
| 44481.583333333336 | 21.105 |
| 44481.59375 | 21.148 |
| 44481.604166666664 | 21.224 |
| 44481.614583333336 | 21.256 |
| 44481.625 | 21.273 |
| 44481.635416666664 | 21.289 |
| 44481.645833333336 | 21.307 |
| 44481.65625 | 21.325 |
| 44481.666666666664 | 21.359 |
| 44481.677083333336 | 21.393 |
| 44481.6875 | 21.445 |
| 44481.697916666664 | 21.486 |
| 44481.708333333336 | 21.525 |
| 44481.71875 | 21.554 |
| 44481.729166666664 | 21.593 |
| 44481.739583333336 | 21.621 |
| 44481.75 | 21.662 |
| 44481.760416666664 | 21.688 |
| 44481.770833333336 | 21.696 |
| 44481.78125 | 21.714 |
| 44481.791666666664 | 21.73 |
| 44481.802083333336 | 21.801 |
| 44481.8125 | 21.835 |
| 44481.822916666664 | 22.064 |
| 44481.833333333336 | 22.148 |
| 44481.84375 | 22.189 |
| 44481.854166666664 | 22.21 |
| 44481.864583333336 | 22.15 |
| 44481.875 | 22.14 |
| 44481.885416666664 | 22.184 |
| 44481.895833333336 | 22.202 |
| 44481.90625 | 22.217 |
| 44481.916666666664 | 22.262 |
| 44481.927083333336 | 22.218 |
| 44481.9375 | 22.31 |
| 44481.947916666664 | 22.275 |
| 44481.958333333336 | 22.251 |
| 44481.96875 | 22.25 |
| 44481.979166666664 | 22.221 |
| 44481.989583333336 | 22.199 |
| 44482.0 | 22.159 |
| 44482.010416666664 | 22.122 |
| 44482.020833333336 | 22.08 |
| 44482.03125 | 22.08 |
| 44482.041666666664 | 22.031 |
| 44482.052083333336 | 22.013 |
| 44482.0625 | 22.034 |
| 44482.072916666664 | 22.052 |
| 44482.083333333336 | 22 |
| 44482.09375 | 21.987 |
| 44482.104166666664 | 21.967 |
| 44482.114583333336 | 21.957 |
| 44482.125 | 21.934 |
| 44482.135416666664 | 21.926 |
| 44482.145833333336 | 21.892 |
| 44482.15625 | 21.81 |
| 44482.166666666664 | 21.778 |
| 44482.177083333336 | 21.776 |
| 44482.1875 | 21.786 |
| 44482.197916666664 | 21.792 |
| 44482.208333333336 | 21.783 |
| 44482.21875 | 21.772 |
| 44482.229166666664 | 21.755 |
| 44482.239583333336 | 21.743 |
| 44482.25 | 21.739 |
| 44482.260416666664 | 21.733 |
| 44482.270833333336 | 21.726 |
| 44482.28125 | 21.719 |
| 44482.291666666664 | 21.715 |
| 44482.302083333336 | 21.737 |
| 44482.3125 | 21.684 |
| 44482.322916666664 | 21.665 |
| 44482.333333333336 | 21.624 |
| 44482.34375 | 21.583 |
| 44482.354166666664 | 21.556 |
| 44482.364583333336 | 21.532 |
| 44482.375 | 21.426 |
| 44482.385416666664 | 21.337 |
| 44482.395833333336 | 21.294 |
| 44482.40625 | 21.344 |
| 44482.416666666664 | 21.311 |
| 44482.427083333336 | 21.261 |
| 44482.4375 | 21.277 |
| 44482.447916666664 | 21.284 |
| 44482.458333333336 | 21.166 |
| 44482.46875 | 21.208 |
| 44482.479166666664 | 21.145 |
| 44482.489583333336 | 21.088 |
| 44482.5 | 21.168 |
| 44482.510416666664 | 21.152 |
| 44482.520833333336 | 21.107 |
| 44482.53125 | 21.147 |
| 44482.541666666664 | 21.182 |
| 44482.552083333336 | 21.218 |
| 44482.5625 | 21.212 |
| 44482.572916666664 | 21.245 |
| 44482.583333333336 | 21.263 |
| 44482.59375 | 21.281 |
| 44482.604166666664 | 21.302 |
| 44482.614583333336 | 21.343 |
| 44482.625 | 21.383 |
| 44482.635416666664 | 21.447 |
| 44482.645833333336 | 21.536 |
| 44482.65625 | 21.574 |
| 44482.666666666664 | 21.593 |
| 44482.677083333336 | 21.602 |
| 44482.6875 | 21.631 |
| 44482.697916666664 | 21.665 |
| 44482.708333333336 | 21.705 |
| 44482.71875 | 21.74 |
| 44482.729166666664 | 21.773 |
| 44482.739583333336 | 21.808 |
| 44482.75 | 21.819 |
| 44482.760416666664 | 21.831 |
| 44482.770833333336 | 21.833 |
| 44482.78125 | 21.834 |
| 44482.791666666664 | 21.839 |
| 44482.802083333336 | 21.846 |
| 44482.8125 | 21.842 |
| 44482.822916666664 | 21.839 |
| 44482.833333333336 | 21.841 |
| 44482.84375 | 21.838 |
| 44482.854166666664 | 21.833 |
| 44482.864583333336 | 21.826 |
| 44482.875 | 21.873 |
| 44482.885416666664 | 21.874 |
| 44482.895833333336 | 21.918 |
| 44482.90625 | 21.937 |
| 44482.916666666664 | 21.954 |
| 44482.927083333336 | 21.968 |
| 44482.9375 | 22.016 |
| 44482.947916666664 | 22.067 |
| 44482.958333333336 | 22.023 |
| 44482.96875 | 22.039 |
| 44482.979166666664 | 22.075 |
| 44482.989583333336 | 22.003 |
| 44483.0 | 22.001 |
| 44483.010416666664 | 21.995 |
| 44483.020833333336 | 21.936 |
| 44483.03125 | 21.965 |
| 44483.041666666664 | 21.913 |
| 44483.052083333336 | 21.869 |
| 44483.0625 | 21.837 |
| 44483.072916666664 | 21.823 |
| 44483.083333333336 | 21.793 |
| 44483.09375 | 21.783 |
| 44483.104166666664 | 21.823 |
| 44483.114583333336 | 21.784 |
| 44483.125 | 21.797 |
| 44483.135416666664 | 21.768 |
| 44483.145833333336 | 21.759 |
| 44483.15625 | 21.746 |
| 44483.166666666664 | 21.728 |
| 44483.177083333336 | 21.711 |
| 44483.1875 | 21.667 |
| 44483.197916666664 | 21.609 |
| 44483.208333333336 | 21.559 |
| 44483.21875 | 21.547 |
| 44483.229166666664 | 21.54 |
| 44483.239583333336 | 21.527 |
| 44483.25 | 21.505 |
| 44483.260416666664 | 21.485 |
| 44483.270833333336 | 21.473 |
| 44483.28125 | 21.467 |
| 44483.291666666664 | 21.458 |
| 44483.302083333336 | 21.443 |
| 44483.3125 | 21.42 |
| 44483.322916666664 | 21.382 |
| 44483.333333333336 | 21.37 |
| 44483.34375 | 21.345 |
| 44483.354166666664 | 21.347 |
| 44483.364583333336 | 21.343 |
| 44483.375 | 21.333 |
| 44483.385416666664 | 21.285 |
| 44483.395833333336 | 21.186 |
| 44483.40625 | 21.11 |
| 44483.416666666664 | 21.016 |
| 44483.427083333336 | 20.945 |
| 44483.4375 | 21.059 |
| 44483.447916666664 | 20.828 |
| 44483.458333333336 | 20.841 |
| 44483.46875 | 20.718 |
| 44483.479166666664 | 20.739 |
| 44483.489583333336 | 20.692 |
| 44483.5 | 20.68 |
| 44483.510416666664 | 20.61 |
| 44483.520833333336 | 20.571 |
| 44483.53125 | 20.627 |
| 44483.541666666664 | 20.586 |
| 44483.552083333336 | 20.642 |
| 44483.5625 | 20.642 |
| 44483.572916666664 | 20.62 |
| 44483.583333333336 | 20.662 |
| 44483.59375 | 20.829 |
| 44483.604166666664 | 20.78 |
| 44483.614583333336 | 20.803 |
| 44483.625 | 20.829 |
| 44483.635416666664 | 20.845 |
| 44483.645833333336 | 20.907 |
| 44483.65625 | 21.071 |
| 44483.666666666664 | 21.165 |
| 44483.677083333336 | 21.423 |
| 44483.6875 | 21.614 |
| 44483.697916666664 | 21.776 |
| 44483.708333333336 | 21.842 |
| 44483.71875 | 21.909 |
| 44483.729166666664 | 21.963 |
| 44483.739583333336 | 22.046 |
| 44483.75 | 22.056 |
| 44483.760416666664 | 22.097 |
| 44483.770833333336 | 22.131 |
| 44483.78125 | 22.162 |
| 44483.791666666664 | 22.175 |
| 44483.802083333336 | 22.173 |
| 44483.8125 | 22.161 |
| 44483.822916666664 | 22.163 |
| 44483.833333333336 | 22.156 |
| 44483.84375 | 22.161 |
| 44483.854166666664 | 22.142 |
| 44483.864583333336 | 22.13 |
| 44483.875 | 22.12 |
| 44483.885416666664 | 22.14 |
| 44483.895833333336 | 22.146 |
| 44483.90625 | 22.159 |
| 44483.916666666664 | 22.193 |
| 44483.927083333336 | 22.342 |
| 44483.9375 | 22.552 |
| 44483.947916666664 | 22.525 |
| 44483.958333333336 | 22.539 |
| 44483.96875 | 22.533 |
| 44483.979166666664 | 22.517 |
| 44483.989583333336 | 22.496 |
| 44484.0 | 22.45 |
| 44484.010416666664 | 22.411 |
| 44484.020833333336 | 22.369 |
| 44484.03125 | 22.231 |
| 44484.041666666664 | 22.202 |
| 44484.052083333336 | 22.149 |
| 44484.0625 | 22.092 |
| 44484.072916666664 | 22.032 |
| 44484.083333333336 | 21.987 |
| 44484.09375 | 21.909 |
| 44484.104166666664 | 21.875 |
| 44484.114583333336 | 21.822 |
| 44484.125 | 21.817 |
| 44484.135416666664 | 21.8 |
| 44484.145833333336 | 21.851 |
| 44484.15625 | 21.872 |
| 44484.166666666664 | 21.83 |
| 44484.177083333336 | 21.839 |
| 44484.1875 | 21.858 |
| 44484.197916666664 | 21.855 |
| 44484.208333333336 | 21.858 |
| 44484.21875 | 21.813 |
| 44484.229166666664 | 21.681 |
| 44484.239583333336 | 21.637 |
| 44484.25 | 21.672 |
| 44484.260416666664 | 21.707 |
| 44484.270833333336 | 21.723 |
| 44484.28125 | 21.717 |
| 44484.291666666664 | 21.714 |
| 44484.302083333336 | 21.714 |
| 44484.3125 | 21.697 |
| 44484.322916666664 | 21.68 |
| 44484.333333333336 | 21.659 |
| 44484.34375 | 21.624 |
| 44484.354166666664 | 21.554 |
| 44484.364583333336 | 21.508 |
| 44484.375 | 21.437 |
| 44484.385416666664 | 21.433 |
| 44484.395833333336 | 21.397 |
| 44484.40625 | 21.437 |
| 44484.416666666664 | 21.417 |
| 44484.427083333336 | 21.429 |
| 44484.4375 | 21.364 |
| 44484.447916666664 | 21.273 |
| 44484.458333333336 | 21.175 |
| 44484.46875 | 21.229 |
| 44484.479166666664 | 21.038 |
| 44484.489583333336 | 21.123 |
| 44484.5 | 20.86 |
| 44484.510416666664 | 20.937 |
| 44484.520833333336 | 20.814 |
| 44484.53125 | 20.854 |
| 44484.541666666664 | 20.805 |
| 44484.552083333336 | 20.793 |
| 44484.5625 | 20.747 |
| 44484.572916666664 | 20.909 |
| 44484.583333333336 | 21.041 |
| 44484.59375 | 20.98 |
| 44484.604166666664 | 21.154 |
| 44484.614583333336 | 21 |
| 44484.625 | 21.07 |
| 44484.635416666664 | 21.102 |
| 44484.645833333336 | 21.252 |
| 44484.65625 | 21.287 |
| 44484.666666666664 | 21.268 |
| 44484.677083333336 | 21.31 |
| 44484.6875 | 21.616 |
| 44484.697916666664 | 21.713 |
| 44484.708333333336 | 21.827 |
| 44484.71875 | 22.103 |
| 44484.729166666664 | 22.308 |
| 44484.739583333336 | 22.416 |
| 44484.75 | 22.533 |
| 44484.760416666664 | 22.634 |
| 44484.770833333336 | 22.674 |
| 44484.78125 | 22.752 |
| 44484.791666666664 | 22.78 |
| 44484.802083333336 | 22.849 |
| 44484.8125 | 22.885 |
| 44484.822916666664 | 22.895 |
| 44484.833333333336 | 22.88 |
| 44484.84375 | 22.776 |
| 44484.854166666664 | 22.771 |
| 44484.864583333336 | 22.681 |
| 44484.875 | 22.661 |
| 44484.885416666664 | 22.618 |
| 44484.895833333336 | 22.582 |
| 44484.90625 | 22.554 |
| 44484.916666666664 | 22.555 |
| 44484.927083333336 | 22.528 |
| 44484.9375 | 22.582 |
| 44484.947916666664 | 22.503 |
| 44484.958333333336 | 22.487 |
| 44484.96875 | 22.516 |
| 44484.979166666664 | 22.615 |
| 44484.989583333336 | 22.587 |
| 44485.0 | 22.637 |
| 44485.010416666664 | 22.626 |
| 44485.020833333336 | 22.737 |
| 44485.03125 | 22.735 |
| 44485.041666666664 | 22.767 |
| 44485.052083333336 | 22.754 |
| 44485.0625 | 22.69 |
| 44485.072916666664 | 22.652 |
| 44485.083333333336 | 22.625 |
| 44485.09375 | 22.61 |
| 44485.104166666664 | 22.573 |
| 44485.114583333336 | 22.558 |
| 44485.125 | 22.493 |
| 44485.135416666664 | 22.466 |
| 44485.145833333336 | 22.454 |
| 44485.15625 | 22.413 |
| 44485.166666666664 | 22.404 |
| 44485.177083333336 | 22.402 |
| 44485.1875 | 22.412 |
| 44485.197916666664 | 22.419 |
| 44485.208333333336 | 22.404 |
| 44485.21875 | 22.4 |
| 44485.229166666664 | 22.356 |
| 44485.239583333336 | 22.345 |
| 44485.25 | 22.271 |
| 44485.260416666664 | 22.089 |
| 44485.270833333336 | 22.085 |
| 44485.28125 | 22.089 |
| 44485.291666666664 | 22.092 |
| 44485.302083333336 | 22.096 |
| 44485.3125 | 22.097 |
| 44485.322916666664 | 22.104 |
| 44485.333333333336 | 22.101 |
| 44485.34375 | 22.094 |
| 44485.354166666664 | 22.078 |
| 44485.364583333336 | 22.051 |
| 44485.375 | 22.028 |
| 44485.385416666664 | 21.941 |
| 44485.395833333336 | 21.91 |
| 44485.40625 | 21.833 |
| 44485.416666666664 | 21.797 |
| 44485.427083333336 | 21.775 |
| 44485.4375 | 21.695 |
| 44485.447916666664 | 21.687 |
| 44485.458333333336 | 21.67 |
| 44485.46875 | 21.668 |
| 44485.479166666664 | 21.648 |
| 44485.489583333336 | 21.626 |
| 44485.5 | 21.568 |
| 44485.510416666664 | 21.517 |
| 44485.520833333336 | 21.489 |
| 44485.53125 | 21.478 |
| 44485.541666666664 | 21.479 |
| 44485.552083333336 | 21.462 |
| 44485.5625 | 21.418 |
| 44485.572916666664 | 21.397 |
| 44485.583333333336 | 21.482 |
| 44485.59375 | 21.516 |
| 44485.604166666664 | 21.597 |
| 44485.614583333336 | 21.718 |
| 44485.625 | 21.757 |
| 44485.635416666664 | 21.849 |
| 44485.645833333336 | 21.935 |
| 44485.65625 | 22.073 |
| 44485.666666666664 | 22.157 |
| 44485.677083333336 | 22.212 |
| 44485.6875 | 22.329 |
| 44485.697916666664 | 22.284 |
| 44485.708333333336 | 22.262 |
| 44485.71875 | 22.29 |
| 44485.729166666664 | 22.424 |
| 44485.739583333336 | 22.433 |
| 44485.75 | 22.593 |
| 44485.760416666664 | 22.716 |
| 44485.770833333336 | 22.825 |
| 44485.78125 | 22.902 |
| 44485.791666666664 | 23.06 |
| 44485.802083333336 | 23.179 |
| 44485.8125 | 23.238 |
| 44485.822916666664 | 23.295 |
| 44485.833333333336 | 23.363 |
| 44485.84375 | 23.411 |
| 44485.854166666664 | 23.429 |
| 44485.864583333336 | 23.408 |
| 44485.875 | 23.38 |
| 44485.885416666664 | 23.331 |
| 44485.895833333336 | 23.291 |
| 44485.90625 | 23.216 |
| 44485.916666666664 | 23.167 |
| 44485.927083333336 | 23.117 |
| 44485.9375 | 23.077 |
| 44485.947916666664 | 22.969 |
| 44485.958333333336 | 22.969 |
| 44485.96875 | 23.01 |
| 44485.979166666664 | 22.984 |
| 44485.989583333336 | 22.91 |
| 44486.0 | 22.896 |
| 44486.010416666664 | 22.853 |
| 44486.020833333336 | 22.794 |
| 44486.03125 | 22.782 |
| 44486.041666666664 | 22.695 |
| 44486.052083333336 | 22.656 |
| 44486.0625 | 22.641 |
| 44486.072916666664 | 22.562 |
| 44486.083333333336 | 22.479 |
| 44486.09375 | 22.408 |
| 44486.104166666664 | 22.346 |
| 44486.114583333336 | 22.317 |
| 44486.125 | 22.209 |
| 44486.135416666664 | 22.157 |
| 44486.145833333336 | 22.081 |
| 44486.15625 | 22.041 |
| 44486.166666666664 | 22.024 |
| 44486.177083333336 | 22.032 |
| 44486.1875 | 22.037 |
| 44486.197916666664 | 22.015 |
| 44486.208333333336 | 22.058 |
| 44486.21875 | 21.977 |
| 44486.229166666664 | 21.962 |
| 44486.239583333336 | 21.914 |
| 44486.25 | 21.868 |
| 44486.260416666664 | 21.806 |
| 44486.270833333336 | 21.728 |
| 44486.28125 | 21.619 |
| 44486.291666666664 | 21.546 |
| 44486.302083333336 | 21.416 |
| 44486.3125 | 21.322 |
| 44486.322916666664 | 21.223 |
| 44486.333333333336 | 21.092 |
| 44486.34375 | 20.981 |
| 44486.354166666664 | 20.926 |
| 44486.364583333336 | 20.857 |
| 44486.375 | 20.798 |
| 44486.385416666664 | 20.755 |
| 44486.395833333336 | 20.719 |
| 44486.40625 | 20.687 |
| 44486.416666666664 | 20.645 |
| 44486.427083333336 | 20.592 |
| 44486.4375 | 20.539 |
| 44486.447916666664 | 20.524 |
| 44486.458333333336 | 20.508 |
| 44486.46875 | 20.477 |
| 44486.479166666664 | 20.434 |
| 44486.489583333336 | 20.472 |
| 44486.5 | 20.446 |
| 44486.510416666664 | 20.398 |
| 44486.520833333336 | 20.309 |
| 44486.53125 | 20.058 |
| 44486.541666666664 | 19.888 |
| 44486.552083333336 | 19.866 |
| 44486.5625 | 19.542 |
| 44486.572916666664 | 19.328 |
| 44486.583333333336 | 19.286 |
| 44486.59375 | 19.442 |
| 44486.604166666664 | 19.449 |
| 44486.614583333336 | 19.282 |
| 44486.625 | 19.291 |
| 44486.635416666664 | 19.564 |
| 44486.645833333336 | 19.431 |
| 44486.65625 | 19.685 |
| 44486.666666666664 | 19.651 |
| 44486.677083333336 | 19.682 |
| 44486.6875 | 19.787 |
| 44486.697916666664 | 19.768 |
| 44486.708333333336 | 19.744 |
| 44486.71875 | 19.831 |
| 44486.729166666664 | 19.758 |
| 44486.739583333336 | 19.823 |
| 44486.75 | 19.764 |
| 44486.760416666664 | 19.81 |
| 44486.770833333336 | 19.817 |
| 44486.78125 | 19.789 |
| 44486.791666666664 | 19.771 |
| 44486.802083333336 | 19.771 |
| 44486.8125 | 19.845 |
| 44486.822916666664 | 19.951 |
| 44486.833333333336 | 20.017 |
| 44486.84375 | 20.034 |
| 44486.854166666664 | 19.984 |
| 44486.864583333336 | 19.925 |
| 44486.875 | 19.931 |
| 44486.885416666664 | 20.007 |
| 44486.895833333336 | 20.032 |
| 44486.90625 | 20.031 |
| 44486.916666666664 | 20.013 |
| 44486.927083333336 | 20.015 |
| 44486.9375 | 19.998 |
| 44486.947916666664 | 19.973 |
| 44486.958333333336 | 19.938 |
| 44486.96875 | 19.909 |
| 44486.979166666664 | 19.899 |
| 44486.989583333336 | 19.88 |
| 44487.0 | 19.87 |
| 44487.010416666664 | 19.832 |
| 44487.020833333336 | 19.821 |
| 44487.03125 | 19.794 |
| 44487.041666666664 | 19.723 |
| 44487.052083333336 | 19.618 |
| 44487.0625 | 19.328 |
| 44487.072916666664 | 19.279 |
| 44487.083333333336 | 19.136 |
| 44487.09375 | 18.988 |
| 44487.104166666664 | 18.824 |
| 44487.114583333336 | 18.581 |
| 44487.125 | 18.803 |
| 44487.135416666664 | 18.436 |
| 44487.145833333336 | 18.299 |
| 44487.15625 | 18.266 |
| 44487.166666666664 | 18.151 |
| 44487.177083333336 | 18.118 |
| 44487.1875 | 18.019 |
| 44487.197916666664 | 18.002 |
| 44487.208333333336 | 18 |
| 44487.21875 | 17.992 |
| 44487.229166666664 | 17.895 |
| 44487.239583333336 | 17.864 |
| 44487.25 | 17.829 |
| 44487.260416666664 | 17.881 |
| 44487.270833333336 | 17.958 |
| 44487.28125 | 17.937 |
| 44487.291666666664 | 17.988 |
| 44487.302083333336 | 17.957 |
| 44487.3125 | 17.975 |
| 44487.322916666664 | 17.95 |
| 44487.333333333336 | 17.904 |
| 44487.34375 | 17.889 |
| 44487.354166666664 | 17.848 |
| 44487.364583333336 | 17.77 |
| 44487.375 | 17.743 |
| 44487.385416666664 | 17.717 |
| 44487.395833333336 | 17.693 |
| 44487.40625 | 17.704 |
| 44487.416666666664 | 17.764 |
| 44487.427083333336 | 17.837 |
| 44487.4375 | 17.878 |
| 44487.447916666664 | 17.939 |
| 44487.458333333336 | 17.943 |
| 44487.46875 | 17.982 |
| 44487.479166666664 | 18.03 |
| 44487.489583333336 | 18.057 |
| 44487.5 | 18.055 |
| 44487.510416666664 | 18.077 |
| 44487.520833333336 | 18.065 |
| 44487.53125 | 18.043 |
| 44487.541666666664 | 18.047 |
| 44487.552083333336 | 17.97 |
| 44487.5625 | 17.817 |
| 44487.572916666664 | 17.623 |
| 44487.583333333336 | 17.511 |
| 44487.59375 | 17.518 |
| 44487.604166666664 | 17.493 |
| 44487.614583333336 | 17.252 |
| 44487.625 | 17.347 |
| 44487.635416666664 | 17.598 |
| 44487.645833333336 | 17.57 |
| 44487.65625 | 17.526 |
| 44487.666666666664 | 17.703 |
| 44487.677083333336 | 17.715 |
| 44487.6875 | 17.858 |
| 44487.697916666664 | 17.935 |
| 44487.708333333336 | 17.979 |
| 44487.71875 | 17.956 |
| 44487.729166666664 | 18.063 |
| 44487.739583333336 | 18.121 |
| 44487.75 | 17.954 |
| 44487.760416666664 | 18.112 |
| 44487.770833333336 | 18.104 |
| 44487.78125 | 17.979 |
| 44487.791666666664 | 17.98 |
| 44487.802083333336 | 17.972 |
| 44487.8125 | 17.997 |
| 44487.822916666664 | 18.016 |
| 44487.833333333336 | 18.025 |
| 44487.84375 | 18.097 |
| 44487.854166666664 | 18.216 |
| 44487.864583333336 | 18.282 |
| 44487.875 | 18.329 |
| 44487.885416666664 | 18.358 |
| 44487.895833333336 | 18.36 |
| 44487.90625 | 18.365 |
| 44487.916666666664 | 18.374 |
| 44487.927083333336 | 18.381 |
| 44487.9375 | 18.375 |
| 44487.947916666664 | 18.374 |
| 44487.958333333336 | 18.366 |
| 44487.96875 | 18.36 |
| 44487.979166666664 | 18.339 |
| 44487.989583333336 | 18.317 |
| 44488.0 | 18.277 |
| 44488.010416666664 | 18.258 |
| 44488.020833333336 | 18.24 |
| 44488.03125 | 18.175 |
| 44488.041666666664 | 18.14 |
| 44488.052083333336 | 18.11 |
| 44488.0625 | 18.063 |
| 44488.072916666664 | 18.058 |
| 44488.083333333336 | 17.921 |
| 44488.09375 | 17.949 |
| 44488.104166666664 | 17.902 |
| 44488.114583333336 | 17.732 |
| 44488.125 | 17.684 |
| 44488.135416666664 | 17.542 |
| 44488.145833333336 | 17.519 |
| 44488.15625 | 17.461 |
| 44488.166666666664 | 17.361 |
| 44488.177083333336 | 17.325 |
| 44488.1875 | 17.239 |
| 44488.197916666664 | 17.154 |
| 44488.208333333336 | 17.138 |
| 44488.21875 | 17.076 |
| 44488.229166666664 | 17.1 |
| 44488.239583333336 | 17.057 |
| 44488.25 | 17.004 |
| 44488.260416666664 | 16.968 |
| 44488.270833333336 | 16.967 |
| 44488.28125 | 16.971 |
| 44488.291666666664 | 17.016 |
| 44488.302083333336 | 17.016 |
| 44488.3125 | 17.051 |
| 44488.322916666664 | 17.042 |
| 44488.333333333336 | 17.036 |
| 44488.34375 | 17.027 |
| 44488.354166666664 | 17.001 |
| 44488.364583333336 | 16.968 |
| 44488.375 | 16.926 |
| 44488.385416666664 | 16.891 |
| 44488.395833333336 | 16.873 |
| 44488.40625 | 16.849 |
| 44488.416666666664 | 16.863 |
| 44488.427083333336 | 16.886 |
| 44488.4375 | 16.891 |
| 44488.447916666664 | 16.924 |
| 44488.458333333336 | 16.974 |
| 44488.46875 | 17.001 |
| 44488.479166666664 | 17.025 |
| 44488.489583333336 | 17.033 |
| 44488.5 | 17.032 |
| 44488.510416666664 | 17.077 |
| 44488.520833333336 | 17.046 |
| 44488.53125 | 17.06 |
| 44488.541666666664 | 17.128 |
| 44488.552083333336 | 17.136 |
| 44488.5625 | 17.135 |
| 44488.572916666664 | 17.104 |
| 44488.583333333336 | 17.007 |
| 44488.59375 | 16.862 |
| 44488.604166666664 | 16.926 |
| 44488.614583333336 | 16.832 |
| 44488.625 | 16.895 |
| 44488.635416666664 | 16.78 |
| 44488.645833333336 | 17.002 |
| 44488.65625 | 17.068 |
| 44488.666666666664 | 17.212 |
| 44488.677083333336 | 17.383 |
| 44488.6875 | 17.528 |
| 44488.697916666664 | 17.522 |
| 44488.708333333336 | 17.672 |
| 44488.71875 | 17.919 |
| 44488.729166666664 | 17.835 |
| 44488.739583333336 | 17.821 |
| 44488.75 | 17.881 |
| 44488.760416666664 | 17.967 |
| 44488.770833333336 | 17.881 |
| 44488.78125 | 17.711 |
| 44488.791666666664 | 17.967 |
| 44488.802083333336 | 17.84 |
| 44488.8125 | 17.809 |
| 44488.822916666664 | 17.828 |
| 44488.833333333336 | 17.781 |
| 44488.84375 | 17.813 |
| 44488.854166666664 | 17.895 |
| 44488.864583333336 | 17.975 |
| 44488.875 | 18.006 |
| 44488.885416666664 | 18.045 |
| 44488.895833333336 | 18.104 |
| 44488.90625 | 18.148 |
| 44488.916666666664 | 18.173 |
| 44488.927083333336 | 18.161 |
| 44488.9375 | 18.155 |
| 44488.947916666664 | 18.148 |
| 44488.958333333336 | 18.142 |
| 44488.96875 | 18.102 |
| 44488.979166666664 | 18.073 |
| 44488.989583333336 | 18.059 |
| 44489.0 | 18.044 |
| 44489.010416666664 | 18.031 |
| 44489.020833333336 | 18.016 |
| 44489.03125 | 18.003 |
| 44489.041666666664 | 17.989 |
| 44489.052083333336 | 17.958 |
| 44489.0625 | 17.938 |
| 44489.072916666664 | 17.952 |
| 44489.083333333336 | 17.918 |
| 44489.09375 | 17.803 |
| 44489.104166666664 | 17.754 |
| 44489.114583333336 | 17.587 |
| 44489.125 | 17.578 |
| 44489.135416666664 | 17.509 |
| 44489.145833333336 | 17.516 |
| 44489.15625 | 17.355 |
| 44489.166666666664 | 17.471 |
| 44489.177083333336 | 17.391 |
| 44489.1875 | 17.289 |
| 44489.197916666664 | 17.205 |
| 44489.208333333336 | 17.135 |
| 44489.21875 | 17.065 |
| 44489.229166666664 | 17.093 |
| 44489.239583333336 | 17.033 |
| 44489.25 | 16.91 |
| 44489.260416666664 | 16.923 |
| 44489.270833333336 | 16.876 |
| 44489.28125 | 16.869 |
| 44489.291666666664 | 16.858 |
| 44489.302083333336 | 16.916 |
| 44489.3125 | 16.861 |
| 44489.322916666664 | 16.903 |
| 44489.333333333336 | 16.927 |
| 44489.34375 | 16.955 |
| 44489.354166666664 | 16.955 |
| 44489.364583333336 | 16.952 |
| 44489.375 | 16.948 |
| 44489.385416666664 | 16.916 |
| 44489.395833333336 | 16.89 |
| 44489.40625 | 16.858 |
| 44489.416666666664 | 16.843 |
| 44489.427083333336 | 16.837 |
| 44489.4375 | 16.823 |
| 44489.447916666664 | 16.8 |
| 44489.458333333336 | 16.813 |
| 44489.46875 | 16.846 |
| 44489.479166666664 | 16.873 |
| 44489.489583333336 | 16.919 |
| 44489.5 | 16.949 |
| 44489.510416666664 | 16.989 |
| 44489.520833333336 | 17.028 |
| 44489.53125 | 17.046 |
| 44489.541666666664 | 17.062 |
| 44489.552083333336 | 17.109 |
| 44489.5625 | 17.148 |
| 44489.572916666664 | 17.196 |
| 44489.583333333336 | 17.18 |
| 44489.59375 | 17.21 |
| 44489.604166666664 | 17.268 |
| 44489.614583333336 | 17.293 |
| 44489.625 | 17.306 |
| 44489.635416666664 | 17.396 |
| 44489.645833333336 | 17.498 |
| 44489.65625 | 17.692 |
| 44489.666666666664 | 17.828 |
| 44489.677083333336 | 17.992 |
| 44489.6875 | 18.122 |
| 44489.697916666664 | 18.144 |
| 44489.708333333336 | 18.215 |
| 44489.71875 | 18.445 |
| 44489.729166666664 | 18.437 |
| 44489.739583333336 | 18.479 |
| 44489.75 | 18.548 |
| 44489.760416666664 | 18.627 |
| 44489.770833333336 | 18.802 |
| 44489.78125 | 18.719 |
| 44489.791666666664 | 18.834 |
| 44489.802083333336 | 18.838 |
| 44489.8125 | 18.81 |
| 44489.822916666664 | 18.741 |
| 44489.833333333336 | 18.739 |
| 44489.84375 | 18.698 |
| 44489.854166666664 | 18.654 |
| 44489.864583333336 | 18.641 |
| 44489.875 | 18.718 |
| 44489.885416666664 | 18.754 |
| 44489.895833333336 | 18.796 |
| 44489.90625 | 18.847 |
| 44489.916666666664 | 18.914 |
| 44489.927083333336 | 18.994 |
| 44489.9375 | 19.014 |
| 44489.947916666664 | 18.999 |
| 44489.958333333336 | 18.997 |
| 44489.96875 | 18.982 |
| 44489.979166666664 | 18.973 |
| 44489.989583333336 | 18.93 |
| 44490.0 | 18.863 |
| 44490.010416666664 | 18.788 |
| 44490.020833333336 | 18.735 |
| 44490.03125 | 18.675 |
| 44490.041666666664 | 18.632 |
| 44490.052083333336 | 18.583 |
| 44490.0625 | 18.56 |
| 44490.072916666664 | 18.528 |
| 44490.083333333336 | 18.517 |
| 44490.09375 | 18.457 |
| 44490.104166666664 | 18.45 |
| 44490.114583333336 | 18.44 |
| 44490.125 | 18.395 |
| 44490.135416666664 | 18.374 |
| 44490.145833333336 | 18.289 |
| 44490.15625 | 18.254 |
| 44490.166666666664 | 18.19 |
| 44490.177083333336 | 18.181 |
| 44490.1875 | 18.16 |
| 44490.197916666664 | 18.181 |
| 44490.208333333336 | 18.16 |
| 44490.21875 | 18.068 |
| 44490.229166666664 | 18.006 |
| 44490.239583333336 | 18.004 |
| 44490.25 | 17.971 |
| 44490.260416666664 | 17.95 |
| 44490.270833333336 | 17.907 |
| 44490.28125 | 17.903 |
| 44490.291666666664 | 17.886 |
| 44490.302083333336 | 17.903 |
| 44490.3125 | 17.926 |
| 44490.322916666664 | 17.868 |
| 44490.333333333336 | 17.923 |
| 44490.34375 | 17.916 |
| 44490.354166666664 | 17.918 |
| 44490.364583333336 | 17.912 |
| 44490.375 | 17.898 |
| 44490.385416666664 | 17.882 |
| 44490.395833333336 | 17.848 |
| 44490.40625 | 17.823 |
| 44490.416666666664 | 17.8 |
| 44490.427083333336 | 17.784 |
| 44490.4375 | 17.76 |
| 44490.447916666664 | 17.731 |
| 44490.458333333336 | 17.71 |
| 44490.46875 | 17.69 |
| 44490.479166666664 | 17.671 |
| 44490.489583333336 | 17.656 |
| 44490.5 | 17.675 |
| 44490.510416666664 | 17.705 |
| 44490.520833333336 | 17.725 |
| 44490.53125 | 17.751 |
| 44490.541666666664 | 17.784 |
| 44490.552083333336 | 17.803 |
| 44490.5625 | 17.831 |
| 44490.572916666664 | 17.863 |
| 44490.583333333336 | 17.884 |
| 44490.59375 | 17.923 |
| 44490.604166666664 | 17.974 |
| 44490.614583333336 | 18.051 |
| 44490.625 | 18.078 |
| 44490.635416666664 | 18.164 |
| 44490.645833333336 | 18.315 |
| 44490.65625 | 18.368 |
| 44490.666666666664 | 18.529 |
| 44490.677083333336 | 18.638 |
| 44490.6875 | 18.779 |
| 44490.697916666664 | 18.962 |
| 44490.708333333336 | 19.011 |
| 44490.71875 | 19.188 |
| 44490.729166666664 | 19.359 |
| 44490.739583333336 | 19.476 |
| 44490.75 | 19.61 |
| 44490.760416666664 | 19.761 |
| 44490.770833333336 | 19.684 |
| 44490.78125 | 19.814 |
| 44490.791666666664 | 19.934 |
| 44490.802083333336 | 19.921 |
| 44490.8125 | 19.94 |
| 44490.822916666664 | 19.927 |
| 44490.833333333336 | 19.954 |
| 44490.84375 | 19.951 |
| 44490.854166666664 | 20.03 |
| 44490.864583333336 | 19.897 |
| 44490.875 | 19.814 |
| 44490.885416666664 | 19.758 |
| 44490.895833333336 | 19.747 |
| 44490.90625 | 19.745 |
| 44490.916666666664 | 19.677 |
| 44490.927083333336 | 19.622 |
| 44490.9375 | 19.583 |
| 44490.947916666664 | 19.549 |
| 44490.958333333336 | 19.528 |
| 44490.96875 | 19.511 |
| 44490.979166666664 | 19.478 |
| 44490.989583333336 | 19.439 |
| 44491.0 | 19.41 |
| 44491.010416666664 | 19.381 |
| 44491.020833333336 | 19.354 |
| 44491.03125 | 19.324 |
| 44491.041666666664 | 19.307 |
| 44491.052083333336 | 19.291 |
| 44491.0625 | 19.261 |
| 44491.072916666664 | 19.245 |
| 44491.083333333336 | 19.184 |
| 44491.09375 | 19.206 |
| 44491.104166666664 | 19.315 |
| 44491.114583333336 | 19.268 |
| 44491.125 | 19.13 |
| 44491.135416666664 | 19.089 |
| 44491.145833333336 | 19.044 |
| 44491.15625 | 18.97 |
| 44491.166666666664 | 18.925 |
| 44491.177083333336 | 18.801 |
| 44491.1875 | 18.83 |
| 44491.197916666664 | 18.676 |
| 44491.208333333336 | 18.839 |
| 44491.21875 | 18.819 |
| 44491.229166666664 | 18.769 |
| 44491.239583333336 | 18.793 |
| 44491.25 | 18.793 |
| 44491.260416666664 | 18.798 |
| 44491.270833333336 | 18.775 |
| 44491.28125 | 18.798 |
| 44491.291666666664 | 18.805 |
| 44491.302083333336 | 18.762 |
| 44491.3125 | 18.792 |
| 44491.322916666664 | 18.802 |
| 44491.333333333336 | 18.796 |
| 44491.34375 | 18.798 |
| 44491.354166666664 | 18.768 |
| 44491.364583333336 | 18.768 |
| 44491.375 | 18.774 |
| 44491.385416666664 | 18.762 |
| 44491.395833333336 | 18.719 |
| 44491.40625 | 18.669 |
| 44491.416666666664 | 18.637 |
| 44491.427083333336 | 18.589 |
| 44491.4375 | 18.562 |
| 44491.447916666664 | 18.554 |
| 44491.458333333336 | 18.542 |
| 44491.46875 | 18.516 |
| 44491.479166666664 | 18.481 |
| 44491.489583333336 | 18.449 |
| 44491.5 | 18.434 |
| 44491.510416666664 | 18.436 |
| 44491.520833333336 | 18.449 |
| 44491.53125 | 18.479 |
| 44491.541666666664 | 18.509 |
| 44491.552083333336 | 18.544 |
| 44491.5625 | 18.578 |
| 44491.572916666664 | 18.6 |
| 44491.583333333336 | 18.629 |
| 44491.59375 | 18.651 |
| 44491.604166666664 | 18.678 |
| 44491.614583333336 | 18.694 |
| 44491.625 | 18.724 |
| 44491.635416666664 | 18.743 |
| 44491.645833333336 | 18.723 |
| 44491.65625 | 18.77 |
| 44491.666666666664 | 18.791 |
| 44491.677083333336 | 18.856 |
| 44491.6875 | 18.908 |
| 44491.697916666664 | 18.997 |
| 44491.708333333336 | 19.04 |
| 44491.71875 | 19.103 |
| 44491.729166666664 | 19.143 |
| 44491.739583333336 | 19.285 |
| 44491.75 | 19.386 |
| 44491.760416666664 | 19.344 |
| 44491.770833333336 | 19.394 |
| 44491.78125 | 19.477 |
| 44491.791666666664 | 19.454 |
| 44491.802083333336 | 19.548 |
| 44491.8125 | 19.632 |
| 44491.822916666664 | 19.605 |
| 44491.833333333336 | 19.65 |
| 44491.84375 | 19.64 |
| 44491.854166666664 | 19.543 |
| 44491.864583333336 | 19.551 |
| 44491.875 | 19.575 |
| 44491.885416666664 | 19.535 |
| 44491.895833333336 | 19.492 |
| 44491.90625 | 19.451 |
| 44491.916666666664 | 19.43 |
| 44491.927083333336 | 19.426 |
| 44491.9375 | 19.432 |
| 44491.947916666664 | 19.427 |
| 44491.958333333336 | 19.415 |
| 44491.96875 | 19.402 |
| 44491.979166666664 | 19.384 |
| 44491.989583333336 | 19.367 |
| 44492.0 | 19.346 |
| 44492.010416666664 | 19.325 |
| 44492.020833333336 | 19.315 |
| 44492.03125 | 19.299 |
| 44492.041666666664 | 19.286 |
| 44492.052083333336 | 19.274 |
| 44492.0625 | 19.26 |
| 44492.072916666664 | 19.251 |
| 44492.083333333336 | 19.242 |
| 44492.09375 | 19.215 |
| 44492.104166666664 | 19.194 |
| 44492.114583333336 | 19.173 |
| 44492.125 | 19.159 |
| 44492.135416666664 | 19.121 |
| 44492.145833333336 | 19.108 |
| 44492.15625 | 19.087 |
| 44492.166666666664 | 19.047 |
| 44492.177083333336 | 18.943 |
| 44492.1875 | 18.916 |
| 44492.197916666664 | 18.915 |
| 44492.208333333336 | 18.772 |
| 44492.21875 | 18.789 |
| 44492.229166666664 | 18.722 |
| 44492.239583333336 | 18.629 |
| 44492.25 | 18.603 |
| 44492.260416666664 | 18.677 |
| 44492.270833333336 | 18.536 |
| 44492.28125 | 18.611 |
| 44492.291666666664 | 18.547 |
| 44492.302083333336 | 18.575 |
| 44492.3125 | 18.584 |
| 44492.322916666664 | 18.564 |
| 44492.333333333336 | 18.594 |
| 44492.34375 | 18.618 |
| 44492.354166666664 | 18.586 |
| 44492.364583333336 | 18.567 |
| 44492.375 | 18.533 |
| 44492.385416666664 | 18.525 |
| 44492.395833333336 | 18.533 |
| 44492.40625 | 18.539 |
| 44492.416666666664 | 18.532 |
| 44492.427083333336 | 18.504 |
| 44492.4375 | 18.485 |
| 44492.447916666664 | 18.462 |
| 44492.458333333336 | 18.438 |
| 44492.46875 | 18.408 |
| 44492.479166666664 | 18.372 |
| 44492.489583333336 | 18.346 |
| 44492.5 | 18.303 |
| 44492.510416666664 | 18.281 |
| 44492.520833333336 | 18.268 |
| 44492.53125 | 18.264 |
| 44492.541666666664 | 18.271 |
| 44492.552083333336 | 18.285 |
| 44492.5625 | 18.29 |
| 44492.572916666664 | 18.314 |
| 44492.583333333336 | 18.372 |
| 44492.59375 | 18.437 |
| 44492.604166666664 | 18.483 |
| 44492.614583333336 | 18.524 |
| 44492.625 | 18.6 |
| 44492.635416666664 | 18.667 |
| 44492.645833333336 | 18.717 |
| 44492.65625 | 18.768 |
| 44492.666666666664 | 18.828 |
| 44492.677083333336 | 18.877 |
| 44492.6875 | 19.026 |
| 44492.697916666664 | 19.162 |
| 44492.708333333336 | 19.31 |
| 44492.71875 | 19.325 |
| 44492.729166666664 | 19.393 |
| 44492.739583333336 | 19.478 |
| 44492.75 | 19.597 |
| 44492.760416666664 | 19.622 |
| 44492.770833333336 | 19.903 |
| 44492.78125 | 19.982 |
| 44492.791666666664 | 19.875 |
| 44492.802083333336 | 20.05 |
| 44492.8125 | 20.076 |
| 44492.822916666664 | 20.129 |
| 44492.833333333336 | 20.259 |
| 44492.84375 | 20.138 |
| 44492.854166666664 | 20.217 |
| 44492.864583333336 | 20.156 |
| 44492.875 | 20.107 |
| 44492.885416666664 | 20.073 |
| 44492.895833333336 | 20.03 |
| 44492.90625 | 19.961 |
| 44492.916666666664 | 19.987 |
| 44492.927083333336 | 19.951 |
| 44492.9375 | 19.916 |
| 44492.947916666664 | 19.876 |
| 44492.958333333336 | 19.856 |
| 44492.96875 | 19.827 |
| 44492.979166666664 | 19.769 |
| 44492.989583333336 | 19.666 |
| 44493.0 | 19.583 |
| 44493.010416666664 | 19.555 |
| 44493.020833333336 | 19.512 |
| 44493.03125 | 19.488 |
| 44493.041666666664 | 19.451 |
| 44493.052083333336 | 19.407 |
| 44493.0625 | 19.385 |
| 44493.072916666664 | 19.359 |
| 44493.083333333336 | 19.341 |
| 44493.09375 | 19.314 |
| 44493.104166666664 | 19.293 |
| 44493.114583333336 | 19.265 |
| 44493.125 | 19.229 |
| 44493.135416666664 | 19.202 |
| 44493.145833333336 | 19.181 |
| 44493.15625 | 19.179 |
| 44493.166666666664 | 19.222 |
| 44493.177083333336 | 19.095 |
| 44493.1875 | 18.981 |
| 44493.197916666664 | 18.962 |
| 44493.208333333336 | 18.758 |
| 44493.21875 | 18.622 |
| 44493.229166666664 | 18.536 |
| 44493.239583333336 | 18.54 |
| 44493.25 | 18.346 |
| 44493.260416666664 | 18.385 |
| 44493.270833333336 | 18.422 |
| 44493.28125 | 18.392 |
| 44493.291666666664 | 18.324 |
| 44493.302083333336 | 18.309 |
| 44493.3125 | 18.261 |
| 44493.322916666664 | 18.201 |
| 44493.333333333336 | 18.23 |
| 44493.34375 | 18.207 |
| 44493.354166666664 | 18.205 |
| 44493.364583333336 | 18.2 |
| 44493.375 | 18.201 |
| 44493.385416666664 | 18.19 |
| 44493.395833333336 | 18.179 |
| 44493.40625 | 18.148 |
| 44493.416666666664 | 18.159 |
| 44493.427083333336 | 18.156 |
| 44493.4375 | 18.144 |
| 44493.447916666664 | 18.157 |
| 44493.458333333336 | 18.146 |
| 44493.46875 | 18.135 |
| 44493.479166666664 | 18.118 |
| 44493.489583333336 | 18.127 |
| 44493.5 | 18.104 |
| 44493.510416666664 | 18.091 |
| 44493.520833333336 | 18.055 |
| 44493.53125 | 18.022 |
| 44493.541666666664 | 18.015 |
| 44493.552083333336 | 18.015 |
| 44493.5625 | 18.021 |
| 44493.572916666664 | 18.039 |
| 44493.583333333336 | 18.062 |
| 44493.59375 | 18.094 |
| 44493.604166666664 | 18.139 |
| 44493.614583333336 | 18.253 |
| 44493.625 | 18.265 |
| 44493.635416666664 | 18.443 |
| 44493.645833333336 | 18.467 |
| 44493.65625 | 18.557 |
| 44493.666666666664 | 18.653 |
| 44493.677083333336 | 18.699 |
| 44493.6875 | 18.736 |
| 44493.697916666664 | 18.778 |
| 44493.708333333336 | 18.855 |
| 44493.71875 | 18.964 |
| 44493.729166666664 | 19.1 |
| 44493.739583333336 | 19.202 |
| 44493.75 | 19.337 |
| 44493.760416666664 | 19.419 |
| 44493.770833333336 | 19.524 |
| 44493.78125 | 19.692 |
| 44493.791666666664 | 19.691 |
| 44493.802083333336 | 19.7 |
| 44493.8125 | 19.798 |
| 44493.822916666664 | 19.937 |
| 44493.833333333336 | 19.845 |
| 44493.84375 | 19.963 |
| 44493.854166666664 | 20.055 |
| 44493.864583333336 | 20.012 |
| 44493.875 | 19.997 |
| 44493.885416666664 | 19.987 |
| 44493.895833333336 | 20.026 |
| 44493.90625 | 19.904 |
| 44493.916666666664 | 19.912 |
| 44493.927083333336 | 19.806 |
| 44493.9375 | 19.837 |
| 44493.947916666664 | 19.78 |
| 44493.958333333336 | 19.728 |
| 44493.96875 | 19.679 |
| 44493.979166666664 | 19.65 |
| 44493.989583333336 | 19.621 |
| 44494.0 | 19.575 |
| 44494.010416666664 | 19.494 |
| 44494.020833333336 | 19.409 |
| 44494.03125 | 19.365 |
| 44494.041666666664 | 19.322 |
| 44494.052083333336 | 19.294 |
| 44494.0625 | 19.256 |
| 44494.072916666664 | 19.217 |
| 44494.083333333336 | 19.207 |
| 44494.09375 | 19.166 |
| 44494.104166666664 | 19.143 |
| 44494.114583333336 | 19.128 |
| 44494.125 | 19.118 |
| 44494.135416666664 | 19.106 |
| 44494.145833333336 | 19.098 |
| 44494.15625 | 19.084 |
| 44494.166666666664 | 19.16 |
| 44494.177083333336 | 19.164 |
| 44494.1875 | 19.083 |
| 44494.197916666664 | 19.062 |
| 44494.208333333336 | 18.998 |
| 44494.21875 | 18.876 |
| 44494.229166666664 | 18.85 |
| 44494.239583333336 | 18.773 |
| 44494.25 | 18.711 |
| 44494.260416666664 | 18.667 |
| 44494.270833333336 | 18.624 |
| 44494.28125 | 18.661 |
| 44494.291666666664 | 18.728 |
| 44494.302083333336 | 18.676 |
| 44494.3125 | 18.677 |
| 44494.322916666664 | 18.715 |
| 44494.333333333336 | 18.718 |
| 44494.34375 | 18.723 |
| 44494.354166666664 | 18.731 |
| 44494.364583333336 | 18.722 |
| 44494.375 | 18.723 |
| 44494.385416666664 | 18.73 |
| 44494.395833333336 | 18.73 |
| 44494.40625 | 18.715 |
| 44494.416666666664 | 18.717 |
| 44494.427083333336 | 18.717 |
| 44494.4375 | 18.696 |
| 44494.447916666664 | 18.698 |
| 44494.458333333336 | 18.698 |
| 44494.46875 | 18.698 |
| 44494.479166666664 | 18.693 |
| 44494.489583333336 | 18.69 |
| 44494.5 | 18.67 |
| 44494.510416666664 | 18.668 |
| 44494.520833333336 | 18.693 |
| 44494.53125 | 18.707 |
| 44494.541666666664 | 18.71 |
| 44494.552083333336 | 18.712 |
| 44494.5625 | 18.724 |
| 44494.572916666664 | 18.744 |
| 44494.583333333336 | 18.776 |
| 44494.59375 | 18.813 |
| 44494.604166666664 | 18.876 |
| 44494.614583333336 | 18.882 |
| 44494.625 | 18.908 |
| 44494.635416666664 | 18.95 |
| 44494.645833333336 | 19.008 |
| 44494.65625 | 19.055 |
| 44494.666666666664 | 19.109 |
| 44494.677083333336 | 19.213 |
| 44494.6875 | 19.298 |
| 44494.697916666664 | 19.304 |
| 44494.708333333336 | 19.331 |
| 44494.71875 | 19.412 |
| 44494.729166666664 | 19.559 |
| 44494.739583333336 | 19.699 |
| 44494.75 | 19.754 |
| 44494.760416666664 | 19.942 |
| 44494.770833333336 | 19.865 |
| 44494.78125 | 19.883 |
| 44494.791666666664 | 20.231 |
| 44494.802083333336 | 20.3 |
| 44494.8125 | 20.329 |
| 44494.822916666664 | 20.395 |
| 44494.833333333336 | 20.395 |
| 44494.84375 | 20.226 |
| 44494.854166666664 | 20.28 |
| 44494.864583333336 | 20.442 |
| 44494.875 | 20.589 |
| 44494.885416666664 | 20.529 |
| 44494.895833333336 | 20.53 |
| 44494.90625 | 20.416 |
| 44494.916666666664 | 20.392 |
| 44494.927083333336 | 20.386 |
| 44494.9375 | 20.358 |
| 44494.947916666664 | 20.356 |
| 44494.958333333336 | 20.342 |
| 44494.96875 | 20.33 |
| 44494.979166666664 | 20.334 |
| 44494.989583333336 | 20.325 |
| 44495.0 | 20.332 |
| 44495.010416666664 | 20.304 |
| 44495.020833333336 | 20.27 |
| 44495.03125 | 20.216 |
| 44495.041666666664 | 20.168 |
| 44495.052083333336 | 20.11 |
| 44495.0625 | 20.008 |
| 44495.072916666664 | 19.942 |
| 44495.083333333336 | 19.909 |
| 44495.09375 | 19.879 |
| 44495.104166666664 | 19.846 |
| 44495.114583333336 | 19.824 |
| 44495.125 | 19.8 |
| 44495.135416666664 | 19.766 |
| 44495.145833333336 | 19.748 |
| 44495.15625 | 19.733 |
| 44495.166666666664 | 19.717 |
| 44495.177083333336 | 19.697 |
| 44495.1875 | 19.697 |
| 44495.197916666664 | 19.697 |
| 44495.208333333336 | 19.75 |
| 44495.21875 | 19.72 |
| 44495.229166666664 | 19.672 |
| 44495.239583333336 | 19.702 |
| 44495.25 | 19.658 |
| 44495.260416666664 | 19.623 |
| 44495.270833333336 | 19.61 |
| 44495.28125 | 19.568 |
| 44495.291666666664 | 19.581 |
| 44495.302083333336 | 19.551 |
| 44495.3125 | 19.586 |
| 44495.322916666664 | 19.603 |
| 44495.333333333336 | 19.62 |
| 44495.34375 | 19.66 |
| 44495.354166666664 | 19.626 |
| 44495.364583333336 | 19.611 |
| 44495.375 | 19.629 |
| 44495.385416666664 | 19.641 |
| 44495.395833333336 | 19.665 |
| 44495.40625 | 19.645 |
| 44495.416666666664 | 19.702 |
| 44495.427083333336 | 19.665 |
| 44495.4375 | 19.628 |
| 44495.447916666664 | 19.645 |
| 44495.458333333336 | 19.655 |
| 44495.46875 | 19.69 |
| 44495.479166666664 | 19.729 |
| 44495.489583333336 | 19.693 |
| 44495.5 | 19.693 |
| 44495.510416666664 | 19.657 |
| 44495.520833333336 | 19.668 |
| 44495.53125 | 19.676 |
| 44495.541666666664 | 19.649 |
| 44495.552083333336 | 19.605 |
| 44495.5625 | 19.557 |
| 44495.572916666664 | 19.536 |
| 44495.583333333336 | 19.514 |
| 44495.59375 | 19.478 |
| 44495.604166666664 | 19.452 |
| 44495.614583333336 | 19.433 |
| 44495.625 | 19.437 |
| 44495.635416666664 | 19.447 |
| 44495.645833333336 | 19.445 |
| 44495.65625 | 19.467 |
| 44495.666666666664 | 19.502 |
| 44495.677083333336 | 19.533 |
| 44495.6875 | 19.568 |
| 44495.697916666664 | 19.601 |
| 44495.708333333336 | 19.636 |
| 44495.71875 | 19.64 |
| 44495.729166666664 | 19.721 |
| 44495.739583333336 | 19.767 |
| 44495.75 | 19.821 |
| 44495.760416666664 | 19.877 |
| 44495.770833333336 | 19.956 |
| 44495.78125 | 20.038 |
| 44495.791666666664 | 20.254 |
| 44495.802083333336 | 20.387 |
| 44495.8125 | 20.334 |
| 44495.822916666664 | 20.275 |
| 44495.833333333336 | 20.287 |
| 44495.84375 | 20.512 |
| 44495.854166666664 | 20.516 |
| 44495.864583333336 | 20.469 |
| 44495.875 | 20.375 |
| 44495.885416666664 | 20.369 |
| 44495.895833333336 | 20.288 |
| 44495.90625 | 20.251 |
| 44495.916666666664 | 20.243 |
| 44495.927083333336 | 20.188 |
| 44495.9375 | 20.121 |
| 44495.947916666664 | 20.071 |
| 44495.958333333336 | 20 |
| 44495.96875 | 19.946 |
| 44495.979166666664 | 19.894 |
| 44495.989583333336 | 19.869 |
| 44496.0 | 19.858 |
| 44496.010416666664 | 19.84 |
| 44496.020833333336 | 19.904 |
| 44496.03125 | 19.826 |
| 44496.041666666664 | 19.81 |
| 44496.052083333336 | 19.77 |
| 44496.0625 | 19.756 |
| 44496.072916666664 | 19.697 |
| 44496.083333333336 | 19.426 |
| 44496.09375 | 19.132 |
| 44496.104166666664 | 18.898 |
| 44496.114583333336 | 18.76 |
| 44496.125 | 18.651 |
| 44496.135416666664 | 18.553 |
| 44496.145833333336 | 18.498 |
| 44496.15625 | 18.336 |
| 44496.166666666664 | 18.211 |
| 44496.177083333336 | 18.08 |
| 44496.1875 | 18.019 |
| 44496.197916666664 | 17.962 |
| 44496.208333333336 | 17.943 |
| 44496.21875 | 17.915 |
| 44496.229166666664 | 17.873 |
| 44496.239583333336 | 17.837 |
| 44496.25 | 17.805 |
| 44496.260416666664 | 17.782 |
| 44496.270833333336 | 17.727 |
| 44496.28125 | 17.773 |
| 44496.291666666664 | 17.611 |
| 44496.302083333336 | 17.488 |
| 44496.3125 | 17.424 |
| 44496.322916666664 | 17.268 |
| 44496.333333333336 | 17.05 |
| 44496.34375 | 16.949 |
| 44496.354166666664 | 16.808 |
| 44496.364583333336 | 16.615 |
| 44496.375 | 16.582 |
| 44496.385416666664 | 16.579 |
| 44496.395833333336 | 16.695 |
| 44496.40625 | 16.36 |
| 44496.416666666664 | 16.118 |
| 44496.427083333336 | 16.26 |
| 44496.4375 | 16.355 |
| 44496.447916666664 | 16.336 |
| 44496.458333333336 | 16.33 |
| 44496.46875 | 16.328 |
| 44496.479166666664 | 16.37 |
| 44496.489583333336 | 16.332 |
| 44496.5 | 16.379 |
| 44496.510416666664 | 16.426 |
| 44496.520833333336 | 16.495 |
| 44496.53125 | 16.405 |
| 44496.541666666664 | 16.399 |
| 44496.552083333336 | 16.442 |
| 44496.5625 | 16.474 |
| 44496.572916666664 | 16.507 |
| 44496.583333333336 | 16.585 |
| 44496.59375 | 16.684 |
| 44496.604166666664 | 16.754 |
| 44496.614583333336 | 16.774 |
| 44496.625 | 16.833 |
| 44496.635416666664 | 16.881 |
| 44496.645833333336 | 16.94 |
| 44496.65625 | 17.03 |
| 44496.666666666664 | 17.132 |
| 44496.677083333336 | 17.211 |
| 44496.6875 | 17.297 |
| 44496.697916666664 | 17.34 |
| 44496.708333333336 | 17.379 |
| 44496.71875 | 17.45 |
| 44496.729166666664 | 17.479 |
| 44496.739583333336 | 17.498 |
| 44496.75 | 17.54 |
| 44496.760416666664 | 17.556 |
| 44496.770833333336 | 17.54 |
| 44496.78125 | 17.445 |
| 44496.791666666664 | 17.648 |
| 44496.802083333336 | 17.518 |
| 44496.8125 | 17.639 |
| 44496.822916666664 | 17.65 |
| 44496.833333333336 | 17.724 |
| 44496.84375 | 17.733 |
| 44496.854166666664 | 17.741 |
| 44496.864583333336 | 17.712 |
| 44496.875 | 17.714 |
| 44496.885416666664 | 17.677 |
| 44496.895833333336 | 17.68 |
| 44496.90625 | 17.678 |
| 44496.916666666664 | 17.663 |
| 44496.927083333336 | 17.668 |
| 44496.9375 | 17.672 |
| 44496.947916666664 | 17.672 |
| 44496.958333333336 | 17.616 |
| 44496.96875 | 17.555 |
| 44496.979166666664 | 17.557 |
| 44496.989583333336 | 17.546 |
| 44497.0 | 17.525 |
| 44497.010416666664 | 17.521 |
| 44497.020833333336 | 17.468 |
| 44497.03125 | 17.469 |
| 44497.041666666664 | 17.439 |
| 44497.052083333336 | 17.411 |
| 44497.0625 | 17.505 |
| 44497.072916666664 | 17.533 |
| 44497.083333333336 | 17.499 |
| 44497.09375 | 17.483 |
| 44497.104166666664 | 17.481 |
| 44497.114583333336 | 17.47 |
| 44497.125 | 17.46 |
| 44497.135416666664 | 17.461 |
| 44497.145833333336 | 17.518 |
| 44497.15625 | 17.542 |
| 44497.166666666664 | 17.559 |
| 44497.177083333336 | 17.594 |
| 44497.1875 | 17.594 |
| 44497.197916666664 | 17.574 |
| 44497.208333333336 | 17.556 |
| 44497.21875 | 17.55 |
| 44497.229166666664 | 17.539 |
| 44497.239583333336 | 17.529 |
| 44497.25 | 17.447 |
| 44497.260416666664 | 17.506 |
| 44497.270833333336 | 17.451 |
| 44497.28125 | 17.435 |
| 44497.291666666664 | 17.4 |
| 44497.302083333336 | 17.363 |
| 44497.3125 | 17.312 |
| 44497.322916666664 | 17.228 |
| 44497.333333333336 | 17.155 |
| 44497.34375 | 17.071 |
| 44497.354166666664 | 17.057 |
| 44497.364583333336 | 16.982 |
| 44497.375 | 16.927 |
| 44497.385416666664 | 16.901 |
| 44497.395833333336 | 16.818 |
| 44497.40625 | 16.876 |
| 44497.416666666664 | 16.755 |
| 44497.427083333336 | 16.722 |
| 44497.4375 | 16.682 |
| 44497.447916666664 | 16.484 |
| 44497.458333333336 | 16.544 |
| 44497.46875 | 16.539 |
| 44497.479166666664 | 16.57 |
| 44497.489583333336 | 16.43 |
| 44497.5 | 16.447 |
| 44497.510416666664 | 16.437 |
| 44497.520833333336 | 16.522 |
| 44497.53125 | 16.505 |
| 44497.541666666664 | 16.549 |
| 44497.552083333336 | 16.521 |
| 44497.5625 | 16.564 |
| 44497.572916666664 | 16.556 |
| 44497.583333333336 | 16.593 |
| 44497.59375 | 16.608 |
| 44497.604166666664 | 16.615 |
| 44497.614583333336 | 16.636 |
| 44497.625 | 16.684 |
| 44497.635416666664 | 16.756 |
| 44497.645833333336 | 16.828 |
| 44497.65625 | 16.904 |
| 44497.666666666664 | 16.936 |
| 44497.677083333336 | 16.966 |
| 44497.6875 | 17.006 |
| 44497.697916666664 | 17.042 |
| 44497.708333333336 | 17.06 |
| 44497.71875 | 17.076 |
| 44497.729166666664 | 17.117 |
| 44497.739583333336 | 17.152 |
| 44497.75 | 17.185 |
| 44497.760416666664 | 17.214 |
| 44497.770833333336 | 17.23 |
| 44497.78125 | 17.249 |
| 44497.791666666664 | 17.187 |
| 44497.802083333336 | 17.269 |
| 44497.8125 | 17.238 |
| 44497.822916666664 | 17.324 |
| 44497.833333333336 | 17.319 |
| 44497.84375 | 17.347 |
| 44497.854166666664 | 17.432 |
| 44497.864583333336 | 17.424 |
| 44497.875 | 17.453 |
| 44497.885416666664 | 17.428 |
| 44497.895833333336 | 17.416 |
| 44497.90625 | 17.409 |
| 44497.916666666664 | 17.383 |
| 44497.927083333336 | 17.39 |
| 44497.9375 | 17.385 |
| 44497.947916666664 | 17.375 |
| 44497.958333333336 | 17.34 |
| 44497.96875 | 17.328 |
| 44497.979166666664 | 17.293 |
| 44497.989583333336 | 17.239 |
| 44498.0 | 17.202 |
| 44498.010416666664 | 17.153 |
| 44498.020833333336 | 17.113 |
| 44498.03125 | 17.06 |
| 44498.041666666664 | 17.027 |
| 44498.052083333336 | 16.995 |
| 44498.0625 | 16.991 |
| 44498.072916666664 | 16.958 |
| 44498.083333333336 | 16.933 |
| 44498.09375 | 16.926 |
| 44498.104166666664 | 16.91 |
| 44498.114583333336 | 16.903 |
| 44498.125 | 16.955 |
| 44498.135416666664 | 16.928 |
| 44498.145833333336 | 16.923 |
| 44498.15625 | 16.909 |
| 44498.166666666664 | 16.924 |
| 44498.177083333336 | 16.924 |
| 44498.1875 | 16.925 |
| 44498.197916666664 | 16.917 |
| 44498.208333333336 | 16.931 |
| 44498.21875 | 16.94 |
| 44498.229166666664 | 16.957 |
| 44498.239583333336 | 16.97 |
| 44498.25 | 16.973 |
| 44498.260416666664 | 16.973 |
| 44498.270833333336 | 16.951 |
| 44498.28125 | 16.9 |
| 44498.291666666664 | 16.834 |
| 44498.302083333336 | 16.815 |
| 44498.3125 | 16.613 |
| 44498.322916666664 | 16.607 |
| 44498.333333333336 | 16.627 |
| 44498.34375 | 16.65 |
| 44498.354166666664 | 16.625 |
| 44498.364583333336 | 16.629 |
| 44498.375 | 16.616 |
| 44498.385416666664 | 16.605 |
| 44498.395833333336 | 16.527 |
| 44498.40625 | 16.556 |
| 44498.416666666664 | 16.541 |
| 44498.427083333336 | 16.489 |
| 44498.4375 | 16.514 |
| 44498.447916666664 | 16.52 |
| 44498.458333333336 | 16.525 |
| 44498.46875 | 16.526 |
| 44498.479166666664 | 16.527 |
| 44498.489583333336 | 16.521 |
| 44498.5 | 16.553 |
| 44498.510416666664 | 16.582 |
| 44498.520833333336 | 16.602 |
| 44498.53125 | 16.639 |
| 44498.541666666664 | 16.655 |
| 44498.552083333336 | 16.678 |
| 44498.5625 | 16.703 |
| 44498.572916666664 | 16.71 |
| 44498.583333333336 | 16.716 |
| 44498.59375 | 16.724 |
| 44498.604166666664 | 16.751 |
| 44498.614583333336 | 16.761 |
| 44498.625 | 16.771 |
| 44498.635416666664 | 16.775 |
| 44498.645833333336 | 16.793 |
| 44498.65625 | 16.795 |
| 44498.666666666664 | 16.838 |
| 44498.677083333336 | 16.897 |
| 44498.6875 | 16.915 |
| 44498.697916666664 | 16.976 |
| 44498.708333333336 | 17.054 |
| 44498.71875 | 17.082 |
| 44498.729166666664 | 17.122 |
| 44498.739583333336 | 17.191 |
| 44498.75 | 17.261 |
| 44498.760416666664 | 17.274 |
| 44498.770833333336 | 17.307 |
| 44498.78125 | 17.343 |
| 44498.791666666664 | 17.574 |
| 44498.802083333336 | 17.578 |
| 44498.8125 | 17.627 |
| 44498.822916666664 | 17.631 |
| 44498.833333333336 | 17.66 |
| 44498.84375 | 17.673 |
| 44498.854166666664 | 17.742 |
| 44498.864583333336 | 17.79 |
| 44498.875 | 17.787 |
| 44498.885416666664 | 17.786 |
| 44498.895833333336 | 17.825 |
| 44498.90625 | 17.793 |
| 44498.916666666664 | 17.782 |
| 44498.927083333336 | 17.81 |
| 44498.9375 | 17.811 |
| 44498.947916666664 | 17.826 |
| 44498.958333333336 | 17.838 |
| 44498.96875 | 17.84 |
| 44498.979166666664 | 17.835 |
| 44498.989583333336 | 17.807 |
| 44499.0 | 17.765 |
| 44499.010416666664 | 17.753 |
| 44499.020833333336 | 17.75 |
| 44499.03125 | 17.743 |
| 44499.041666666664 | 17.722 |
| 44499.052083333336 | 17.692 |
| 44499.0625 | 17.661 |
| 44499.072916666664 | 17.629 |
| 44499.083333333336 | 17.602 |
| 44499.09375 | 17.581 |
| 44499.104166666664 | 17.572 |
| 44499.114583333336 | 17.539 |
| 44499.125 | 17.536 |
| 44499.135416666664 | 17.544 |
| 44499.145833333336 | 17.57 |
| 44499.15625 | 17.522 |
| 44499.166666666664 | 17.515 |
| 44499.177083333336 | 17.509 |
| 44499.1875 | 17.51 |
| 44499.197916666664 | 17.494 |
| 44499.208333333336 | 17.454 |
| 44499.21875 | 17.415 |
| 44499.229166666664 | 17.402 |
| 44499.239583333336 | 17.38 |
| 44499.25 | 17.373 |
| 44499.260416666664 | 17.333 |
| 44499.270833333336 | 17.345 |
| 44499.28125 | 17.332 |
| 44499.291666666664 | 17.325 |
| 44499.302083333336 | 17.292 |
| 44499.3125 | 17.219 |
| 44499.322916666664 | 17.218 |
| 44499.333333333336 | 17.236 |
| 44499.34375 | 17.236 |
| 44499.354166666664 | 17.231 |
| 44499.364583333336 | 17.212 |
| 44499.375 | 17.215 |
| 44499.385416666664 | 17.184 |
| 44499.395833333336 | 17.155 |
| 44499.40625 | 17.144 |
| 44499.416666666664 | 17.129 |
| 44499.427083333336 | 17.115 |
| 44499.4375 | 17.078 |
| 44499.447916666664 | 16.93 |
| 44499.458333333336 | 16.66 |
| 44499.46875 | 16.463 |
| 44499.479166666664 | 16.381 |
| 44499.489583333336 | 16.266 |
| 44499.5 | 16.152 |
| 44499.510416666664 | 16.127 |
| 44499.520833333336 | 16.022 |
| 44499.53125 | 15.915 |
| 44499.541666666664 | 15.989 |
| 44499.552083333336 | 16.132 |
| 44499.5625 | 16.248 |
| 44499.572916666664 | 16.277 |
| 44499.583333333336 | 16.308 |
| 44499.59375 | 16.364 |
| 44499.604166666664 | 16.407 |
| 44499.614583333336 | 16.426 |
| 44499.625 | 16.453 |
| 44499.635416666664 | 16.484 |
| 44499.645833333336 | 16.587 |
| 44499.65625 | 16.668 |
| 44499.666666666664 | 16.751 |
| 44499.677083333336 | 16.92 |
| 44499.6875 | 17.012 |
| 44499.697916666664 | 17.128 |
| 44499.708333333336 | 17.237 |
| 44499.71875 | 17.299 |
| 44499.729166666664 | 17.316 |
| 44499.739583333336 | 17.338 |
| 44499.75 | 17.37 |
| 44499.760416666664 | 17.398 |
| 44499.770833333336 | 17.44 |
| 44499.78125 | 17.47 |
| 44499.791666666664 | 17.518 |
| 44499.802083333336 | 17.575 |
| 44499.8125 | 17.612 |
| 44499.822916666664 | 17.651 |
| 44499.833333333336 | 17.672 |
| 44499.84375 | 17.713 |
| 44499.854166666664 | 17.69 |
| 44499.864583333336 | 17.584 |
| 44499.875 | 17.667 |
| 44499.885416666664 | 17.613 |
| 44499.895833333336 | 17.662 |
| 44499.90625 | 17.631 |
| 44499.916666666664 | 17.653 |
| 44499.927083333336 | 17.677 |
| 44499.9375 | 17.677 |
| 44499.947916666664 | 17.681 |
| 44499.958333333336 | 17.689 |
| 44499.96875 | 17.675 |
| 44499.979166666664 | 17.709 |
| 44499.989583333336 | 17.7 |
| 44500.0 | 17.615 |
| 44500.010416666664 | 17.68 |
| 44500.020833333336 | 17.673 |
| 44500.03125 | 17.658 |
| 44500.041666666664 | 17.636 |
| 44500.052083333336 | 17.609 |
| 44500.0625 | 17.579 |
| 44500.072916666664 | 17.544 |
| 44500.083333333336 | 17.472 |
| 44500.09375 | 17.409 |
| 44500.104166666664 | 17.362 |
| 44500.114583333336 | 17.326 |
| 44500.125 | 17.329 |
| 44500.135416666664 | 17.309 |
| 44500.145833333336 | 17.272 |
| 44500.15625 | 17.272 |
| 44500.166666666664 | 17.261 |
| 44500.177083333336 | 17.256 |
| 44500.1875 | 17.259 |
| 44500.197916666664 | 17.27 |
| 44500.208333333336 | 17.262 |
| 44500.21875 | 17.254 |
| 44500.229166666664 | 17.247 |
| 44500.239583333336 | 17.2 |
| 44500.25 | 17.13 |
| 44500.260416666664 | 17.111 |
| 44500.270833333336 | 17.101 |
| 44500.28125 | 17.087 |
| 44500.291666666664 | 17.077 |
| 44500.302083333336 | 17.062 |
| 44500.3125 | 17.047 |
| 44500.322916666664 | 17.044 |
| 44500.333333333336 | 17.034 |
| 44500.34375 | 17.019 |
| 44500.354166666664 | 17.009 |
| 44500.364583333336 | 16.995 |
| 44500.375 | 16.975 |
| 44500.385416666664 | 16.975 |
| 44500.395833333336 | 16.95 |
| 44500.40625 | 16.958 |
| 44500.416666666664 | 16.91 |
| 44500.427083333336 | 16.864 |
| 44500.4375 | 16.746 |
| 44500.447916666664 | 16.673 |
| 44500.458333333336 | 16.55 |
| 44500.46875 | 16.473 |
| 44500.479166666664 | 16.312 |
| 44500.489583333336 | 16.296 |
| 44500.5 | 16.09 |
| 44500.510416666664 | 15.922 |
| 44500.520833333336 | 15.955 |
| 44500.53125 | 15.742 |
| 44500.541666666664 | 15.773 |
| 44500.552083333336 | 15.681 |
| 44500.5625 | 15.739 |
| 44500.572916666664 | 15.738 |
| 44500.583333333336 | 15.899 |
| 44500.59375 | 15.91 |
| 44500.604166666664 | 15.999 |
| 44500.614583333336 | 16.214 |
| 44500.625 | 16.193 |
| 44500.635416666664 | 16.305 |
| 44500.645833333336 | 16.342 |
| 44500.65625 | 16.475 |
| 44500.666666666664 | 16.39 |
| 44500.677083333336 | 16.438 |
| 44500.6875 | 16.427 |
| 44500.697916666664 | 16.432 |
| 44500.708333333336 | 16.537 |
| 44500.71875 | 16.623 |
| 44500.729166666664 | 16.801 |
| 44500.739583333336 | 16.988 |
| 44500.75 | 17.239 |
| 44500.760416666664 | 17.347 |
| 44500.770833333336 | 17.408 |
| 44500.78125 | 17.456 |
| 44500.791666666664 | 17.508 |
| 44500.802083333336 | 17.556 |
| 44500.8125 | 17.6 |
| 44500.822916666664 | 17.634 |
| 44500.833333333336 | 17.657 |
| 44500.84375 | 17.688 |
| 44500.854166666664 | 17.708 |
| 44500.864583333336 | 17.719 |
| 44500.875 | 17.733 |
| 44500.885416666664 | 17.743 |
| 44500.895833333336 | 17.746 |
| 44500.90625 | 17.748 |
| 44500.916666666664 | 17.744 |
| 44500.927083333336 | 17.619 |
| 44500.9375 | 17.645 |
| 44500.947916666664 | 17.666 |
| 44500.958333333336 | 17.727 |
| 44500.96875 | 17.758 |
| 44500.979166666664 | 17.791 |
| 44500.989583333336 | 17.863 |
| 44501.0 | 17.893 |
| 44501.010416666664 | 17.934 |
| 44501.020833333336 | 17.954 |
| 44501.03125 | 17.946 |
| 44501.041666666664 | 17.979 |
| 44501.052083333336 | 17.978 |
| 44501.0625 | 17.927 |
| 44501.072916666664 | 17.84 |
| 44501.083333333336 | 17.803 |
| 44501.09375 | 17.754 |
| 44501.104166666664 | 17.693 |
| 44501.114583333336 | 17.691 |
| 44501.125 | 17.695 |
| 44501.135416666664 | 17.732 |
| 44501.145833333336 | 17.704 |
| 44501.15625 | 17.679 |